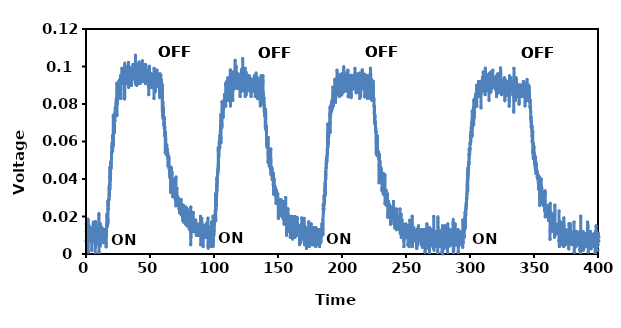
| Category | Series 0 |
|---|---|
| 0.0 | 0.007 |
| 0.1 | 0.012 |
| 0.2 | 0.016 |
| 0.3 | 0.014 |
| 0.4 | 0.009 |
| 0.5 | 0.01 |
| 0.6 | 0.007 |
| 0.7 | 0.01 |
| 0.8 | 0.015 |
| 0.9 | 0.01 |
| 1.0 | 0.009 |
| 1.1 | 0.009 |
| 1.2 | 0.012 |
| 1.3 | 0.01 |
| 1.4 | 0.007 |
| 1.5 | 0.015 |
| 1.6 | 0.015 |
| 1.7 | 0.018 |
| 1.8 | 0.001 |
| 1.9 | 0.014 |
| 2.0 | 0.015 |
| 2.1 | 0.01 |
| 2.2 | 0.007 |
| 2.3 | 0.015 |
| 2.4 | 0.012 |
| 2.5 | 0.012 |
| 2.6 | 0.013 |
| 2.7 | 0.014 |
| 2.8 | 0.009 |
| 2.9 | 0.013 |
| 3.0 | 0.011 |
| 3.1 | 0.013 |
| 3.2 | 0.012 |
| 3.3 | 0.012 |
| 3.4 | 0.009 |
| 3.5 | 0.01 |
| 3.6 | 0.01 |
| 3.7 | 0.012 |
| 3.8 | 0.009 |
| 3.9 | 0.011 |
| 4.0 | 0.01 |
| 4.1 | 0.011 |
| 4.2 | 0.013 |
| 4.3 | 0.009 |
| 4.4 | 0.008 |
| 4.5 | 0.002 |
| 4.6 | 0.006 |
| 4.7 | 0.011 |
| 4.8 | 0.007 |
| 4.9 | 0.014 |
| 5.0 | 0.007 |
| 5.1 | 0.012 |
| 5.2 | 0.013 |
| 5.3 | 0.009 |
| 5.4 | 0.01 |
| 5.5 | 0.009 |
| 5.6 | 0.016 |
| 5.7 | 0.01 |
| 5.8 | 0.017 |
| 5.9 | 0.008 |
| 6.0 | 0.012 |
| 6.1 | 0.013 |
| 6.2 | 0.009 |
| 6.3 | 0.014 |
| 6.4 | 0.011 |
| 6.5 | 0.012 |
| 6.6 | 0.009 |
| 6.7 | 0.01 |
| 6.8 | 0.012 |
| 6.9 | 0.011 |
| 7.0 | 0.01 |
| 7.1 | 0.008 |
| 7.2 | 0.005 |
| 7.3 | -0.002 |
| 7.4 | 0.016 |
| 7.5 | 0.015 |
| 7.6 | 0.006 |
| 7.7 | 0.012 |
| 7.8 | 0.009 |
| 7.9 | 0.013 |
| 8.0 | 0.014 |
| 8.1 | 0.01 |
| 8.2 | 0.012 |
| 8.3 | 0.011 |
| 8.4 | 0.013 |
| 8.5 | 0.01 |
| 8.6 | 0.009 |
| 8.7 | 0.012 |
| 8.8 | 0.012 |
| 8.9 | 0.012 |
| 9.0 | 0.01 |
| 9.1 | 0.011 |
| 9.2 | 0.01 |
| 9.3 | 0.012 |
| 9.4 | 0.008 |
| 9.5 | 0.011 |
| 9.6 | 0.011 |
| 9.7 | 0.009 |
| 9.8 | 0.011 |
| 9.9 | 0.005 |
| 10.0 | 0.016 |
| 10.1 | 0.021 |
| 10.2 | 0.001 |
| 10.3 | 0.007 |
| 10.4 | 0.007 |
| 10.5 | 0.011 |
| 10.6 | 0.005 |
| 10.7 | 0.009 |
| 10.8 | 0.01 |
| 10.9 | 0.012 |
| 11.0 | 0.01 |
| 11.1 | 0.005 |
| 11.2 | 0.005 |
| 11.3 | 0.015 |
| 11.4 | 0.015 |
| 11.5 | 0.007 |
| 11.6 | 0.009 |
| 11.7 | 0.011 |
| 11.8 | 0.011 |
| 11.9 | 0.01 |
| 12.0 | 0.01 |
| 12.1 | 0.012 |
| 12.2 | 0.01 |
| 12.3 | 0.01 |
| 12.4 | 0.014 |
| 12.5 | 0.009 |
| 12.6 | 0.013 |
| 12.7 | 0.012 |
| 12.8 | 0.012 |
| 12.9 | 0.01 |
| 13.0 | 0.008 |
| 13.1 | 0.009 |
| 13.2 | 0.012 |
| 13.3 | 0.01 |
| 13.4 | 0.01 |
| 13.5 | 0.012 |
| 13.6 | 0.01 |
| 13.7 | 0.012 |
| 13.8 | 0.006 |
| 13.9 | 0.013 |
| 14.0 | 0.011 |
| 14.1 | 0.012 |
| 14.2 | 0.01 |
| 14.3 | 0.007 |
| 14.4 | 0.01 |
| 14.5 | 0.011 |
| 14.6 | 0.009 |
| 14.7 | 0.008 |
| 14.8 | 0.009 |
| 14.9 | 0.01 |
| 15.0 | 0.009 |
| 15.1 | 0.012 |
| 15.2 | 0.013 |
| 15.3 | 0.012 |
| 15.4 | 0.013 |
| 15.5 | 0.012 |
| 15.6 | 0.013 |
| 15.7 | 0.004 |
| 15.8 | 0.006 |
| 15.9 | 0.009 |
| 16.0 | 0.013 |
| 16.1 | 0.016 |
| 16.2 | 0.016 |
| 16.3 | 0.02 |
| 16.4 | 0.021 |
| 16.5 | 0.015 |
| 16.6 | 0.015 |
| 16.7 | 0.02 |
| 16.8 | 0.021 |
| 16.9 | 0.016 |
| 17.0 | 0.028 |
| 17.1 | 0.017 |
| 17.2 | 0.018 |
| 17.3 | 0.024 |
| 17.4 | 0.024 |
| 17.5 | 0.028 |
| 17.6 | 0.026 |
| 17.7 | 0.029 |
| 17.8 | 0.029 |
| 17.9 | 0.029 |
| 18.0 | 0.032 |
| 18.1 | 0.036 |
| 18.2 | 0.035 |
| 18.3 | 0.037 |
| 18.4 | 0.031 |
| 18.5 | 0.041 |
| 18.6 | 0.046 |
| 18.7 | 0.035 |
| 18.8 | 0.037 |
| 18.9 | 0.04 |
| 19.0 | 0.039 |
| 19.1 | 0.042 |
| 19.2 | 0.043 |
| 19.3 | 0.047 |
| 19.4 | 0.049 |
| 19.5 | 0.046 |
| 19.6 | 0.046 |
| 19.7 | 0.048 |
| 19.8 | 0.05 |
| 19.9 | 0.05 |
| 20.0 | 0.054 |
| 20.1 | 0.054 |
| 20.2 | 0.057 |
| 20.3 | 0.059 |
| 20.4 | 0.057 |
| 20.5 | 0.055 |
| 20.6 | 0.059 |
| 20.7 | 0.062 |
| 20.8 | 0.055 |
| 20.9 | 0.063 |
| 21.0 | 0.063 |
| 21.1 | 0.061 |
| 21.2 | 0.059 |
| 21.3 | 0.074 |
| 21.4 | 0.058 |
| 21.5 | 0.071 |
| 21.6 | 0.064 |
| 21.7 | 0.068 |
| 21.8 | 0.066 |
| 21.9 | 0.065 |
| 22.0 | 0.067 |
| 22.1 | 0.071 |
| 22.2 | 0.071 |
| 22.3 | 0.065 |
| 22.4 | 0.074 |
| 22.5 | 0.073 |
| 22.6 | 0.071 |
| 22.7 | 0.075 |
| 22.8 | 0.076 |
| 22.9 | 0.078 |
| 23.0 | 0.077 |
| 23.1 | 0.075 |
| 23.2 | 0.076 |
| 23.3 | 0.078 |
| 23.4 | 0.08 |
| 23.5 | 0.078 |
| 23.6 | 0.081 |
| 23.7 | 0.083 |
| 23.8 | 0.081 |
| 23.9 | 0.083 |
| 24.0 | 0.081 |
| 24.1 | 0.091 |
| 24.2 | 0.074 |
| 24.3 | 0.081 |
| 24.4 | 0.084 |
| 24.5 | 0.08 |
| 24.6 | 0.087 |
| 24.7 | 0.085 |
| 24.8 | 0.085 |
| 24.9 | 0.086 |
| 25.0 | 0.084 |
| 25.1 | 0.086 |
| 25.2 | 0.083 |
| 25.3 | 0.087 |
| 25.4 | 0.085 |
| 25.5 | 0.088 |
| 25.6 | 0.092 |
| 25.7 | 0.09 |
| 25.8 | 0.09 |
| 25.9 | 0.089 |
| 26.0 | 0.089 |
| 26.1 | 0.09 |
| 26.2 | 0.092 |
| 26.3 | 0.089 |
| 26.4 | 0.092 |
| 26.5 | 0.093 |
| 26.6 | 0.088 |
| 26.7 | 0.09 |
| 26.8 | 0.09 |
| 26.9 | 0.095 |
| 27.0 | 0.085 |
| 27.1 | 0.085 |
| 27.2 | 0.088 |
| 27.3 | 0.083 |
| 27.4 | 0.093 |
| 27.5 | 0.093 |
| 27.6 | 0.094 |
| 27.7 | 0.093 |
| 27.8 | 0.094 |
| 27.9 | 0.093 |
| 28.0 | 0.099 |
| 28.1 | 0.093 |
| 28.2 | 0.091 |
| 28.3 | 0.095 |
| 28.4 | 0.099 |
| 28.5 | 0.097 |
| 28.6 | 0.095 |
| 28.7 | 0.093 |
| 28.8 | 0.095 |
| 28.9 | 0.097 |
| 29.0 | 0.094 |
| 29.1 | 0.095 |
| 29.2 | 0.092 |
| 29.3 | 0.094 |
| 29.4 | 0.098 |
| 29.5 | 0.094 |
| 29.6 | 0.095 |
| 29.7 | 0.095 |
| 29.8 | 0.093 |
| 29.9 | 0.097 |
| 30.0 | 0.097 |
| 30.1 | 0.085 |
| 30.2 | 0.084 |
| 30.3 | 0.101 |
| 30.4 | 0.099 |
| 30.5 | 0.097 |
| 30.6 | 0.097 |
| 30.7 | 0.095 |
| 30.8 | 0.097 |
| 30.9 | 0.1 |
| 31.0 | 0.098 |
| 31.1 | 0.091 |
| 31.2 | 0.099 |
| 31.3 | 0.096 |
| 31.4 | 0.095 |
| 31.5 | 0.099 |
| 31.6 | 0.098 |
| 31.7 | 0.095 |
| 31.8 | 0.095 |
| 31.9 | 0.098 |
| 32.0 | 0.096 |
| 32.1 | 0.095 |
| 32.2 | 0.095 |
| 32.3 | 0.098 |
| 32.4 | 0.096 |
| 32.5 | 0.098 |
| 32.6 | 0.096 |
| 32.7 | 0.098 |
| 32.8 | 0.094 |
| 32.9 | 0.092 |
| 33.0 | 0.093 |
| 33.1 | 0.097 |
| 33.2 | 0.102 |
| 33.3 | 0.089 |
| 33.4 | 0.095 |
| 33.5 | 0.096 |
| 33.6 | 0.097 |
| 33.7 | 0.096 |
| 33.8 | 0.094 |
| 33.9 | 0.094 |
| 34.0 | 0.098 |
| 34.1 | 0.09 |
| 34.2 | 0.093 |
| 34.3 | 0.095 |
| 34.4 | 0.099 |
| 34.5 | 0.099 |
| 34.6 | 0.094 |
| 34.7 | 0.096 |
| 34.8 | 0.097 |
| 34.9 | 0.096 |
| 35.0 | 0.095 |
| 35.1 | 0.095 |
| 35.2 | 0.099 |
| 35.3 | 0.096 |
| 35.4 | 0.097 |
| 35.5 | 0.096 |
| 35.6 | 0.09 |
| 35.7 | 0.093 |
| 35.8 | 0.093 |
| 35.9 | 0.093 |
| 36.0 | 0.098 |
| 36.1 | 0.095 |
| 36.2 | 0.095 |
| 36.3 | 0.096 |
| 36.4 | 0.098 |
| 36.5 | 0.098 |
| 36.6 | 0.094 |
| 36.7 | 0.101 |
| 36.8 | 0.099 |
| 36.9 | 0.098 |
| 37.0 | 0.095 |
| 37.1 | 0.096 |
| 37.2 | 0.097 |
| 37.3 | 0.096 |
| 37.4 | 0.096 |
| 37.5 | 0.096 |
| 37.6 | 0.098 |
| 37.7 | 0.097 |
| 37.8 | 0.099 |
| 37.9 | 0.098 |
| 38.0 | 0.096 |
| 38.1 | 0.1 |
| 38.2 | 0.094 |
| 38.3 | 0.095 |
| 38.4 | 0.094 |
| 38.5 | 0.093 |
| 38.6 | 0.095 |
| 38.7 | 0.106 |
| 38.8 | 0.092 |
| 38.9 | 0.091 |
| 39.0 | 0.096 |
| 39.1 | 0.099 |
| 39.2 | 0.097 |
| 39.3 | 0.096 |
| 39.4 | 0.096 |
| 39.5 | 0.101 |
| 39.6 | 0.098 |
| 39.7 | 0.09 |
| 39.8 | 0.096 |
| 39.9 | 0.092 |
| 40.0 | 0.095 |
| 40.1 | 0.096 |
| 40.2 | 0.098 |
| 40.3 | 0.098 |
| 40.4 | 0.093 |
| 40.5 | 0.098 |
| 40.6 | 0.097 |
| 40.7 | 0.094 |
| 40.8 | 0.094 |
| 40.9 | 0.098 |
| 41.0 | 0.096 |
| 41.1 | 0.096 |
| 41.2 | 0.099 |
| 41.3 | 0.094 |
| 41.4 | 0.1 |
| 41.5 | 0.102 |
| 41.6 | 0.091 |
| 41.7 | 0.097 |
| 41.8 | 0.093 |
| 41.9 | 0.093 |
| 42.0 | 0.097 |
| 42.1 | 0.096 |
| 42.2 | 0.094 |
| 42.3 | 0.095 |
| 42.4 | 0.091 |
| 42.5 | 0.095 |
| 42.6 | 0.094 |
| 42.7 | 0.096 |
| 42.8 | 0.098 |
| 42.9 | 0.096 |
| 43.0 | 0.093 |
| 43.1 | 0.093 |
| 43.2 | 0.095 |
| 43.3 | 0.096 |
| 43.4 | 0.093 |
| 43.5 | 0.095 |
| 43.6 | 0.098 |
| 43.7 | 0.099 |
| 43.8 | 0.095 |
| 43.9 | 0.096 |
| 44.0 | 0.103 |
| 44.1 | 0.093 |
| 44.2 | 0.099 |
| 44.3 | 0.093 |
| 44.4 | 0.099 |
| 44.5 | 0.095 |
| 44.6 | 0.093 |
| 44.7 | 0.092 |
| 44.8 | 0.095 |
| 44.9 | 0.101 |
| 45.0 | 0.096 |
| 45.1 | 0.092 |
| 45.2 | 0.097 |
| 45.3 | 0.093 |
| 45.4 | 0.096 |
| 45.5 | 0.097 |
| 45.6 | 0.098 |
| 45.7 | 0.093 |
| 45.8 | 0.092 |
| 45.9 | 0.096 |
| 46.0 | 0.093 |
| 46.1 | 0.095 |
| 46.2 | 0.092 |
| 46.3 | 0.098 |
| 46.4 | 0.091 |
| 46.5 | 0.094 |
| 46.6 | 0.101 |
| 46.7 | 0.096 |
| 46.8 | 0.095 |
| 46.9 | 0.093 |
| 47.0 | 0.093 |
| 47.1 | 0.097 |
| 47.2 | 0.098 |
| 47.3 | 0.094 |
| 47.4 | 0.096 |
| 47.5 | 0.092 |
| 47.6 | 0.094 |
| 47.7 | 0.093 |
| 47.8 | 0.094 |
| 47.9 | 0.096 |
| 48.0 | 0.093 |
| 48.1 | 0.095 |
| 48.2 | 0.098 |
| 48.3 | 0.093 |
| 48.4 | 0.093 |
| 48.5 | 0.093 |
| 48.6 | 0.098 |
| 48.7 | 0.091 |
| 48.8 | 0.089 |
| 48.9 | 0.092 |
| 49.0 | 0.085 |
| 49.1 | 0.094 |
| 49.2 | 0.098 |
| 49.3 | 0.097 |
| 49.4 | 0.093 |
| 49.5 | 0.1 |
| 49.6 | 0.098 |
| 49.7 | 0.095 |
| 49.8 | 0.093 |
| 49.9 | 0.09 |
| 50.0 | 0.093 |
| 50.1 | 0.092 |
| 50.2 | 0.095 |
| 50.3 | 0.093 |
| 50.4 | 0.093 |
| 50.5 | 0.092 |
| 50.6 | 0.096 |
| 50.7 | 0.096 |
| 50.8 | 0.094 |
| 50.9 | 0.09 |
| 51.0 | 0.089 |
| 51.1 | 0.089 |
| 51.2 | 0.089 |
| 51.3 | 0.093 |
| 51.4 | 0.095 |
| 51.5 | 0.095 |
| 51.6 | 0.095 |
| 51.7 | 0.092 |
| 51.8 | 0.09 |
| 51.9 | 0.092 |
| 52.0 | 0.092 |
| 52.1 | 0.091 |
| 52.2 | 0.093 |
| 52.3 | 0.095 |
| 52.4 | 0.095 |
| 52.5 | 0.094 |
| 52.6 | 0.093 |
| 52.7 | 0.092 |
| 52.8 | 0.095 |
| 52.9 | 0.096 |
| 53.0 | 0.094 |
| 53.1 | 0.083 |
| 53.2 | 0.099 |
| 53.3 | 0.089 |
| 53.4 | 0.095 |
| 53.5 | 0.095 |
| 53.6 | 0.096 |
| 53.7 | 0.093 |
| 53.8 | 0.092 |
| 53.9 | 0.09 |
| 54.0 | 0.095 |
| 54.1 | 0.087 |
| 54.2 | 0.088 |
| 54.3 | 0.096 |
| 54.4 | 0.093 |
| 54.5 | 0.092 |
| 54.6 | 0.093 |
| 54.7 | 0.092 |
| 54.8 | 0.089 |
| 54.9 | 0.094 |
| 55.0 | 0.093 |
| 55.1 | 0.095 |
| 55.2 | 0.095 |
| 55.3 | 0.095 |
| 55.4 | 0.098 |
| 55.5 | 0.09 |
| 55.6 | 0.092 |
| 55.7 | 0.094 |
| 55.8 | 0.094 |
| 55.9 | 0.095 |
| 56.0 | 0.096 |
| 56.1 | 0.09 |
| 56.2 | 0.092 |
| 56.3 | 0.093 |
| 56.4 | 0.091 |
| 56.5 | 0.093 |
| 56.6 | 0.093 |
| 56.7 | 0.095 |
| 56.8 | 0.093 |
| 56.9 | 0.093 |
| 57.0 | 0.092 |
| 57.1 | 0.092 |
| 57.2 | 0.09 |
| 57.3 | 0.089 |
| 57.4 | 0.095 |
| 57.5 | 0.084 |
| 57.6 | 0.085 |
| 57.7 | 0.089 |
| 57.8 | 0.096 |
| 57.9 | 0.093 |
| 58.0 | 0.092 |
| 58.1 | 0.092 |
| 58.2 | 0.087 |
| 58.3 | 0.095 |
| 58.4 | 0.095 |
| 58.5 | 0.091 |
| 58.6 | 0.091 |
| 58.7 | 0.093 |
| 58.8 | 0.092 |
| 58.9 | 0.09 |
| 59.0 | 0.092 |
| 59.1 | 0.091 |
| 59.2 | 0.089 |
| 59.3 | 0.087 |
| 59.4 | 0.088 |
| 59.5 | 0.086 |
| 59.6 | 0.082 |
| 59.7 | 0.076 |
| 59.8 | 0.09 |
| 59.9 | 0.074 |
| 60.0 | 0.074 |
| 60.1 | 0.081 |
| 60.2 | 0.077 |
| 60.3 | 0.077 |
| 60.4 | 0.078 |
| 60.5 | 0.078 |
| 60.6 | 0.076 |
| 60.7 | 0.069 |
| 60.8 | 0.073 |
| 60.9 | 0.073 |
| 61.0 | 0.072 |
| 61.1 | 0.072 |
| 61.2 | 0.067 |
| 61.3 | 0.07 |
| 61.4 | 0.067 |
| 61.5 | 0.068 |
| 61.6 | 0.063 |
| 61.7 | 0.064 |
| 61.8 | 0.065 |
| 61.9 | 0.054 |
| 62.0 | 0.065 |
| 62.1 | 0.059 |
| 62.2 | 0.063 |
| 62.3 | 0.057 |
| 62.4 | 0.059 |
| 62.5 | 0.056 |
| 62.6 | 0.058 |
| 62.7 | 0.054 |
| 62.8 | 0.053 |
| 62.9 | 0.054 |
| 63.0 | 0.055 |
| 63.1 | 0.058 |
| 63.2 | 0.056 |
| 63.3 | 0.054 |
| 63.4 | 0.055 |
| 63.5 | 0.056 |
| 63.6 | 0.053 |
| 63.7 | 0.052 |
| 63.8 | 0.054 |
| 63.9 | 0.053 |
| 64.0 | 0.051 |
| 64.1 | 0.047 |
| 64.2 | 0.049 |
| 64.3 | 0.048 |
| 64.4 | 0.048 |
| 64.5 | 0.051 |
| 64.6 | 0.052 |
| 64.7 | 0.049 |
| 64.8 | 0.051 |
| 64.9 | 0.046 |
| 65.0 | 0.047 |
| 65.1 | 0.046 |
| 65.2 | 0.043 |
| 65.3 | 0.046 |
| 65.4 | 0.041 |
| 65.5 | 0.046 |
| 65.6 | 0.043 |
| 65.7 | 0.043 |
| 65.8 | 0.042 |
| 65.9 | 0.042 |
| 66.0 | 0.04 |
| 66.1 | 0.033 |
| 66.2 | 0.046 |
| 66.3 | 0.043 |
| 66.4 | 0.039 |
| 66.5 | 0.043 |
| 66.6 | 0.046 |
| 66.7 | 0.045 |
| 66.8 | 0.045 |
| 66.9 | 0.037 |
| 67.0 | 0.038 |
| 67.1 | 0.043 |
| 67.2 | 0.043 |
| 67.3 | 0.035 |
| 67.4 | 0.038 |
| 67.5 | 0.039 |
| 67.6 | 0.038 |
| 67.7 | 0.037 |
| 67.8 | 0.031 |
| 67.9 | 0.031 |
| 68.0 | 0.033 |
| 68.1 | 0.034 |
| 68.2 | 0.04 |
| 68.3 | 0.036 |
| 68.4 | 0.034 |
| 68.5 | 0.034 |
| 68.6 | 0.035 |
| 68.7 | 0.032 |
| 68.8 | 0.031 |
| 68.9 | 0.031 |
| 69.0 | 0.031 |
| 69.1 | 0.032 |
| 69.2 | 0.034 |
| 69.3 | 0.032 |
| 69.4 | 0.032 |
| 69.5 | 0.032 |
| 69.6 | 0.03 |
| 69.7 | 0.034 |
| 69.8 | 0.029 |
| 69.9 | 0.035 |
| 70.0 | 0.034 |
| 70.1 | 0.03 |
| 70.2 | 0.026 |
| 70.3 | 0.041 |
| 70.4 | 0.032 |
| 70.5 | 0.029 |
| 70.6 | 0.032 |
| 70.7 | 0.03 |
| 70.8 | 0.03 |
| 70.9 | 0.031 |
| 71.0 | 0.031 |
| 71.1 | 0.035 |
| 71.2 | 0.029 |
| 71.3 | 0.029 |
| 71.4 | 0.027 |
| 71.5 | 0.029 |
| 71.6 | 0.028 |
| 71.7 | 0.027 |
| 71.8 | 0.029 |
| 71.9 | 0.027 |
| 72.0 | 0.03 |
| 72.1 | 0.026 |
| 72.2 | 0.026 |
| 72.3 | 0.027 |
| 72.4 | 0.027 |
| 72.5 | 0.029 |
| 72.6 | 0.026 |
| 72.7 | 0.024 |
| 72.8 | 0.025 |
| 72.9 | 0.027 |
| 73.0 | 0.026 |
| 73.1 | 0.022 |
| 73.2 | 0.024 |
| 73.3 | 0.023 |
| 73.4 | 0.022 |
| 73.5 | 0.023 |
| 73.6 | 0.024 |
| 73.7 | 0.022 |
| 73.8 | 0.025 |
| 73.9 | 0.027 |
| 74.0 | 0.027 |
| 74.1 | 0.024 |
| 74.2 | 0.025 |
| 74.3 | 0.029 |
| 74.4 | 0.023 |
| 74.5 | 0.021 |
| 74.6 | 0.025 |
| 74.7 | 0.021 |
| 74.8 | 0.024 |
| 74.9 | 0.024 |
| 75.0 | 0.025 |
| 75.1 | 0.025 |
| 75.2 | 0.023 |
| 75.3 | 0.02 |
| 75.4 | 0.023 |
| 75.5 | 0.02 |
| 75.6 | 0.018 |
| 75.7 | 0.022 |
| 75.8 | 0.022 |
| 75.9 | 0.021 |
| 76.0 | 0.018 |
| 76.1 | 0.026 |
| 76.2 | 0.021 |
| 76.3 | 0.017 |
| 76.4 | 0.021 |
| 76.5 | 0.021 |
| 76.6 | 0.02 |
| 76.7 | 0.022 |
| 76.8 | 0.023 |
| 76.9 | 0.019 |
| 77.0 | 0.018 |
| 77.1 | 0.023 |
| 77.2 | 0.02 |
| 77.3 | 0.019 |
| 77.4 | 0.021 |
| 77.5 | 0.017 |
| 77.6 | 0.02 |
| 77.7 | 0.016 |
| 77.8 | 0.018 |
| 77.9 | 0.016 |
| 78.0 | 0.021 |
| 78.1 | 0.025 |
| 78.2 | 0.02 |
| 78.3 | 0.017 |
| 78.4 | 0.016 |
| 78.5 | 0.017 |
| 78.6 | 0.02 |
| 78.7 | 0.02 |
| 78.8 | 0.022 |
| 78.9 | 0.02 |
| 79.0 | 0.024 |
| 79.1 | 0.015 |
| 79.2 | 0.02 |
| 79.3 | 0.018 |
| 79.4 | 0.019 |
| 79.5 | 0.019 |
| 79.6 | 0.017 |
| 79.7 | 0.018 |
| 79.8 | 0.018 |
| 79.9 | 0.019 |
| 80.0 | 0.017 |
| 80.1 | 0.023 |
| 80.2 | 0.018 |
| 80.3 | 0.016 |
| 80.4 | 0.018 |
| 80.5 | 0.015 |
| 80.6 | 0.014 |
| 80.7 | 0.02 |
| 80.8 | 0.02 |
| 80.9 | 0.018 |
| 81.0 | 0.016 |
| 81.1 | 0.013 |
| 81.2 | 0.014 |
| 81.3 | 0.018 |
| 81.4 | 0.016 |
| 81.5 | 0.015 |
| 81.6 | 0.015 |
| 81.7 | 0.016 |
| 81.8 | 0.005 |
| 81.9 | 0.025 |
| 82.0 | 0.009 |
| 82.1 | 0.015 |
| 82.2 | 0.016 |
| 82.3 | 0.019 |
| 82.4 | 0.012 |
| 82.5 | 0.015 |
| 82.6 | 0.012 |
| 82.7 | 0.018 |
| 82.8 | 0.019 |
| 82.9 | 0.015 |
| 83.0 | 0.015 |
| 83.1 | 0.013 |
| 83.2 | 0.016 |
| 83.3 | 0.014 |
| 83.4 | 0.017 |
| 83.5 | 0.013 |
| 83.6 | 0.014 |
| 83.7 | 0.019 |
| 83.8 | 0.022 |
| 83.9 | 0.012 |
| 84.0 | 0.015 |
| 84.1 | 0.015 |
| 84.2 | 0.014 |
| 84.3 | 0.015 |
| 84.4 | 0.015 |
| 84.5 | 0.018 |
| 84.6 | 0.017 |
| 84.7 | 0.015 |
| 84.8 | 0.015 |
| 84.9 | 0.013 |
| 85.0 | 0.013 |
| 85.1 | 0.013 |
| 85.2 | 0.016 |
| 85.3 | 0.015 |
| 85.4 | 0.012 |
| 85.5 | 0.016 |
| 85.6 | 0.016 |
| 85.7 | 0.018 |
| 85.8 | 0.012 |
| 85.9 | 0.013 |
| 86.0 | 0.016 |
| 86.1 | 0.013 |
| 86.2 | 0.01 |
| 86.3 | 0.013 |
| 86.4 | 0.011 |
| 86.5 | 0.013 |
| 86.6 | 0.013 |
| 86.7 | 0.011 |
| 86.8 | 0.015 |
| 86.9 | 0.015 |
| 87.0 | 0.01 |
| 87.1 | 0.014 |
| 87.2 | 0.016 |
| 87.3 | 0.015 |
| 87.4 | 0.012 |
| 87.5 | 0.013 |
| 87.6 | 0.013 |
| 87.7 | 0.014 |
| 87.8 | 0.014 |
| 87.9 | 0.01 |
| 88.0 | 0.014 |
| 88.1 | 0.011 |
| 88.2 | 0.011 |
| 88.3 | 0.013 |
| 88.4 | 0.014 |
| 88.5 | 0.012 |
| 88.6 | 0.013 |
| 88.7 | 0.01 |
| 88.8 | 0.012 |
| 88.9 | 0.013 |
| 89.0 | 0.013 |
| 89.1 | 0.013 |
| 89.2 | 0.013 |
| 89.3 | 0.01 |
| 89.4 | 0.013 |
| 89.5 | 0.02 |
| 89.6 | 0.005 |
| 89.7 | 0.015 |
| 89.8 | 0.011 |
| 89.9 | 0.01 |
| 90.0 | 0.018 |
| 90.1 | 0.013 |
| 90.2 | 0.01 |
| 90.3 | 0.007 |
| 90.4 | 0.012 |
| 90.5 | 0.019 |
| 90.6 | 0.012 |
| 90.7 | 0.014 |
| 90.8 | 0.012 |
| 90.9 | 0.013 |
| 91.0 | 0.015 |
| 91.1 | 0.013 |
| 91.2 | 0.01 |
| 91.3 | 0.01 |
| 91.4 | 0.015 |
| 91.5 | 0.004 |
| 91.6 | 0.013 |
| 91.7 | 0.012 |
| 91.8 | 0.013 |
| 91.9 | 0.013 |
| 92.0 | 0.015 |
| 92.1 | 0.011 |
| 92.2 | 0.015 |
| 92.3 | 0.015 |
| 92.4 | 0.011 |
| 92.5 | 0.012 |
| 92.6 | 0.013 |
| 92.7 | 0.015 |
| 92.8 | 0.009 |
| 92.9 | 0.012 |
| 93.0 | 0.015 |
| 93.1 | 0.014 |
| 93.2 | 0.013 |
| 93.3 | 0.012 |
| 93.4 | 0.009 |
| 93.5 | 0.013 |
| 93.6 | 0.01 |
| 93.7 | 0.01 |
| 93.8 | 0.011 |
| 93.9 | 0.01 |
| 94.0 | 0.012 |
| 94.1 | 0.009 |
| 94.2 | 0.012 |
| 94.3 | 0.016 |
| 94.4 | 0.016 |
| 94.5 | 0.01 |
| 94.6 | 0.012 |
| 94.7 | 0.012 |
| 94.8 | 0.009 |
| 94.9 | 0.013 |
| 95.0 | 0.013 |
| 95.1 | 0.01 |
| 95.2 | 0.012 |
| 95.3 | 0.019 |
| 95.4 | 0.004 |
| 95.5 | 0.005 |
| 95.6 | 0.01 |
| 95.7 | 0.011 |
| 95.8 | 0.012 |
| 95.9 | 0.012 |
| 96.0 | 0.012 |
| 96.1 | 0.009 |
| 96.2 | 0.014 |
| 96.3 | 0.014 |
| 96.4 | 0.012 |
| 96.5 | 0.013 |
| 96.6 | 0.013 |
| 96.7 | 0.009 |
| 96.8 | 0.01 |
| 96.9 | 0.012 |
| 97.0 | 0.007 |
| 97.1 | 0.009 |
| 97.2 | 0.009 |
| 97.3 | 0.007 |
| 97.4 | 0.008 |
| 97.5 | 0.006 |
| 97.6 | 0.01 |
| 97.7 | 0.011 |
| 97.8 | 0.013 |
| 97.9 | 0.004 |
| 98.0 | 0.011 |
| 98.1 | 0.017 |
| 98.2 | 0.007 |
| 98.3 | 0.015 |
| 98.4 | 0.015 |
| 98.5 | 0.007 |
| 98.6 | 0.01 |
| 98.7 | 0.012 |
| 98.8 | 0.011 |
| 98.9 | 0.01 |
| 99.0 | 0.012 |
| 99.1 | 0.009 |
| 99.2 | 0.013 |
| 99.3 | 0.02 |
| 99.4 | 0.005 |
| 99.5 | 0.006 |
| 99.6 | 0.011 |
| 99.7 | 0.013 |
| 99.8 | 0.014 |
| 99.9 | 0.01 |
| 100.0 | 0.015 |
| 100.1 | 0.012 |
| 100.2 | 0.018 |
| 100.3 | 0.016 |
| 100.4 | 0.018 |
| 100.5 | 0.017 |
| 100.6 | 0.019 |
| 100.7 | 0.02 |
| 100.8 | 0.021 |
| 100.9 | 0.019 |
| 101.0 | 0.023 |
| 101.1 | 0.021 |
| 101.2 | 0.026 |
| 101.3 | 0.032 |
| 101.4 | 0.018 |
| 101.5 | 0.026 |
| 101.6 | 0.024 |
| 101.7 | 0.026 |
| 101.8 | 0.031 |
| 101.9 | 0.026 |
| 102.0 | 0.037 |
| 102.1 | 0.032 |
| 102.2 | 0.04 |
| 102.3 | 0.04 |
| 102.4 | 0.034 |
| 102.5 | 0.038 |
| 102.6 | 0.04 |
| 102.7 | 0.042 |
| 102.8 | 0.042 |
| 102.9 | 0.043 |
| 103.0 | 0.045 |
| 103.1 | 0.044 |
| 103.2 | 0.045 |
| 103.3 | 0.056 |
| 103.4 | 0.055 |
| 103.5 | 0.046 |
| 103.6 | 0.051 |
| 103.7 | 0.052 |
| 103.8 | 0.056 |
| 103.9 | 0.053 |
| 104.0 | 0.056 |
| 104.1 | 0.059 |
| 104.2 | 0.06 |
| 104.3 | 0.061 |
| 104.4 | 0.059 |
| 104.5 | 0.057 |
| 104.6 | 0.063 |
| 104.7 | 0.061 |
| 104.8 | 0.063 |
| 104.9 | 0.063 |
| 105.0 | 0.066 |
| 105.1 | 0.067 |
| 105.2 | 0.069 |
| 105.3 | 0.074 |
| 105.4 | 0.06 |
| 105.5 | 0.062 |
| 105.6 | 0.071 |
| 105.7 | 0.071 |
| 105.8 | 0.067 |
| 105.9 | 0.073 |
| 106.0 | 0.074 |
| 106.1 | 0.068 |
| 106.2 | 0.069 |
| 106.3 | 0.081 |
| 106.4 | 0.077 |
| 106.5 | 0.076 |
| 106.6 | 0.074 |
| 106.7 | 0.078 |
| 106.8 | 0.079 |
| 106.9 | 0.079 |
| 107.0 | 0.078 |
| 107.1 | 0.075 |
| 107.2 | 0.073 |
| 107.3 | 0.078 |
| 107.4 | 0.077 |
| 107.5 | 0.078 |
| 107.6 | 0.079 |
| 107.7 | 0.081 |
| 107.8 | 0.081 |
| 107.9 | 0.082 |
| 108.0 | 0.081 |
| 108.1 | 0.082 |
| 108.2 | 0.085 |
| 108.3 | 0.082 |
| 108.4 | 0.084 |
| 108.5 | 0.085 |
| 108.6 | 0.085 |
| 108.7 | 0.085 |
| 108.8 | 0.085 |
| 108.9 | 0.085 |
| 109.0 | 0.082 |
| 109.1 | 0.079 |
| 109.2 | 0.09 |
| 109.3 | 0.091 |
| 109.4 | 0.09 |
| 109.5 | 0.09 |
| 109.6 | 0.083 |
| 109.7 | 0.086 |
| 109.8 | 0.084 |
| 109.9 | 0.082 |
| 110.0 | 0.092 |
| 110.1 | 0.085 |
| 110.2 | 0.087 |
| 110.3 | 0.09 |
| 110.4 | 0.089 |
| 110.5 | 0.09 |
| 110.6 | 0.087 |
| 110.7 | 0.091 |
| 110.8 | 0.094 |
| 110.9 | 0.091 |
| 111.0 | 0.086 |
| 111.1 | 0.082 |
| 111.2 | 0.092 |
| 111.3 | 0.09 |
| 111.4 | 0.09 |
| 111.5 | 0.09 |
| 111.6 | 0.089 |
| 111.7 | 0.092 |
| 111.8 | 0.093 |
| 111.9 | 0.089 |
| 112.0 | 0.092 |
| 112.1 | 0.09 |
| 112.2 | 0.091 |
| 112.3 | 0.088 |
| 112.4 | 0.092 |
| 112.5 | 0.092 |
| 112.6 | 0.091 |
| 112.7 | 0.09 |
| 112.8 | 0.098 |
| 112.9 | 0.079 |
| 113.0 | 0.092 |
| 113.1 | 0.095 |
| 113.2 | 0.093 |
| 113.3 | 0.089 |
| 113.4 | 0.096 |
| 113.5 | 0.093 |
| 113.6 | 0.088 |
| 113.7 | 0.092 |
| 113.8 | 0.087 |
| 113.9 | 0.092 |
| 114.0 | 0.091 |
| 114.1 | 0.095 |
| 114.2 | 0.093 |
| 114.3 | 0.095 |
| 114.4 | 0.09 |
| 114.5 | 0.091 |
| 114.6 | 0.088 |
| 114.7 | 0.082 |
| 114.8 | 0.092 |
| 114.9 | 0.097 |
| 115.0 | 0.095 |
| 115.1 | 0.093 |
| 115.2 | 0.088 |
| 115.3 | 0.096 |
| 115.4 | 0.09 |
| 115.5 | 0.09 |
| 115.6 | 0.09 |
| 115.7 | 0.095 |
| 115.8 | 0.093 |
| 115.9 | 0.09 |
| 116.0 | 0.092 |
| 116.1 | 0.091 |
| 116.2 | 0.09 |
| 116.3 | 0.095 |
| 116.4 | 0.089 |
| 116.5 | 0.103 |
| 116.6 | 0.099 |
| 116.7 | 0.094 |
| 116.8 | 0.093 |
| 116.9 | 0.093 |
| 117.0 | 0.095 |
| 117.1 | 0.09 |
| 117.2 | 0.089 |
| 117.3 | 0.1 |
| 117.4 | 0.094 |
| 117.5 | 0.094 |
| 117.6 | 0.092 |
| 117.7 | 0.093 |
| 117.8 | 0.091 |
| 117.9 | 0.092 |
| 118.0 | 0.09 |
| 118.1 | 0.093 |
| 118.2 | 0.092 |
| 118.3 | 0.093 |
| 118.4 | 0.095 |
| 118.5 | 0.089 |
| 118.6 | 0.089 |
| 118.7 | 0.096 |
| 118.8 | 0.093 |
| 118.9 | 0.096 |
| 119.0 | 0.093 |
| 119.1 | 0.094 |
| 119.2 | 0.095 |
| 119.3 | 0.093 |
| 119.4 | 0.093 |
| 119.5 | 0.092 |
| 119.6 | 0.09 |
| 119.7 | 0.095 |
| 119.8 | 0.09 |
| 119.9 | 0.093 |
| 120.0 | 0.093 |
| 120.1 | 0.092 |
| 120.2 | 0.093 |
| 120.3 | 0.093 |
| 120.4 | 0.084 |
| 120.5 | 0.095 |
| 120.6 | 0.089 |
| 120.7 | 0.092 |
| 120.8 | 0.088 |
| 120.9 | 0.09 |
| 121.0 | 0.095 |
| 121.1 | 0.092 |
| 121.2 | 0.096 |
| 121.3 | 0.089 |
| 121.4 | 0.098 |
| 121.5 | 0.097 |
| 121.6 | 0.094 |
| 121.7 | 0.093 |
| 121.8 | 0.091 |
| 121.9 | 0.088 |
| 122.0 | 0.092 |
| 122.1 | 0.093 |
| 122.2 | 0.096 |
| 122.3 | 0.087 |
| 122.4 | 0.104 |
| 122.5 | 0.098 |
| 122.6 | 0.096 |
| 122.7 | 0.09 |
| 122.8 | 0.095 |
| 122.9 | 0.094 |
| 123.0 | 0.098 |
| 123.1 | 0.089 |
| 123.2 | 0.09 |
| 123.3 | 0.092 |
| 123.4 | 0.09 |
| 123.5 | 0.093 |
| 123.6 | 0.093 |
| 123.7 | 0.093 |
| 123.8 | 0.092 |
| 123.9 | 0.093 |
| 124.0 | 0.093 |
| 124.1 | 0.094 |
| 124.2 | 0.09 |
| 124.3 | 0.099 |
| 124.4 | 0.084 |
| 124.5 | 0.093 |
| 124.6 | 0.093 |
| 124.7 | 0.089 |
| 124.8 | 0.091 |
| 124.9 | 0.097 |
| 125.0 | 0.093 |
| 125.1 | 0.085 |
| 125.2 | 0.096 |
| 125.3 | 0.093 |
| 125.4 | 0.095 |
| 125.5 | 0.092 |
| 125.6 | 0.09 |
| 125.7 | 0.094 |
| 125.8 | 0.093 |
| 125.9 | 0.09 |
| 126.0 | 0.094 |
| 126.1 | 0.092 |
| 126.2 | 0.093 |
| 126.3 | 0.087 |
| 126.4 | 0.093 |
| 126.5 | 0.094 |
| 126.6 | 0.092 |
| 126.7 | 0.088 |
| 126.8 | 0.089 |
| 126.9 | 0.093 |
| 127.0 | 0.095 |
| 127.1 | 0.09 |
| 127.2 | 0.09 |
| 127.3 | 0.092 |
| 127.4 | 0.09 |
| 127.5 | 0.093 |
| 127.6 | 0.095 |
| 127.7 | 0.093 |
| 127.8 | 0.089 |
| 127.9 | 0.092 |
| 128.0 | 0.092 |
| 128.1 | 0.094 |
| 128.2 | 0.093 |
| 128.3 | 0.088 |
| 128.4 | 0.09 |
| 128.5 | 0.092 |
| 128.6 | 0.089 |
| 128.7 | 0.089 |
| 128.8 | 0.086 |
| 128.9 | 0.092 |
| 129.0 | 0.084 |
| 129.1 | 0.093 |
| 129.2 | 0.089 |
| 129.3 | 0.09 |
| 129.4 | 0.093 |
| 129.5 | 0.09 |
| 129.6 | 0.092 |
| 129.7 | 0.09 |
| 129.8 | 0.09 |
| 129.9 | 0.093 |
| 130.0 | 0.091 |
| 130.1 | 0.087 |
| 130.2 | 0.088 |
| 130.3 | 0.088 |
| 130.4 | 0.089 |
| 130.5 | 0.09 |
| 130.6 | 0.092 |
| 130.7 | 0.088 |
| 130.8 | 0.089 |
| 130.9 | 0.093 |
| 131.0 | 0.089 |
| 131.1 | 0.09 |
| 131.2 | 0.087 |
| 131.3 | 0.093 |
| 131.4 | 0.09 |
| 131.5 | 0.095 |
| 131.6 | 0.093 |
| 131.7 | 0.09 |
| 131.8 | 0.091 |
| 131.9 | 0.093 |
| 132.0 | 0.092 |
| 132.1 | 0.091 |
| 132.2 | 0.089 |
| 132.3 | 0.084 |
| 132.4 | 0.086 |
| 132.5 | 0.092 |
| 132.6 | 0.086 |
| 132.7 | 0.088 |
| 132.8 | 0.095 |
| 132.9 | 0.096 |
| 133.0 | 0.087 |
| 133.1 | 0.087 |
| 133.2 | 0.093 |
| 133.3 | 0.09 |
| 133.4 | 0.09 |
| 133.5 | 0.091 |
| 133.6 | 0.092 |
| 133.7 | 0.094 |
| 133.8 | 0.089 |
| 133.9 | 0.093 |
| 134.0 | 0.092 |
| 134.1 | 0.093 |
| 134.2 | 0.086 |
| 134.3 | 0.083 |
| 134.4 | 0.093 |
| 134.5 | 0.09 |
| 134.6 | 0.092 |
| 134.7 | 0.087 |
| 134.8 | 0.09 |
| 134.9 | 0.087 |
| 135.0 | 0.089 |
| 135.1 | 0.09 |
| 135.2 | 0.092 |
| 135.3 | 0.09 |
| 135.4 | 0.092 |
| 135.5 | 0.087 |
| 135.6 | 0.092 |
| 135.7 | 0.093 |
| 135.8 | 0.093 |
| 135.9 | 0.09 |
| 136.0 | 0.087 |
| 136.1 | 0.088 |
| 136.2 | 0.079 |
| 136.3 | 0.092 |
| 136.4 | 0.082 |
| 136.5 | 0.093 |
| 136.6 | 0.09 |
| 136.7 | 0.092 |
| 136.8 | 0.095 |
| 136.9 | 0.093 |
| 137.0 | 0.094 |
| 137.1 | 0.092 |
| 137.2 | 0.086 |
| 137.3 | 0.091 |
| 137.4 | 0.09 |
| 137.5 | 0.089 |
| 137.6 | 0.089 |
| 137.7 | 0.091 |
| 137.8 | 0.089 |
| 137.9 | 0.09 |
| 138.0 | 0.087 |
| 138.1 | 0.091 |
| 138.2 | 0.095 |
| 138.3 | 0.092 |
| 138.4 | 0.08 |
| 138.5 | 0.086 |
| 138.6 | 0.085 |
| 138.7 | 0.082 |
| 138.8 | 0.082 |
| 138.9 | 0.08 |
| 139.0 | 0.081 |
| 139.1 | 0.083 |
| 139.2 | 0.078 |
| 139.3 | 0.076 |
| 139.4 | 0.079 |
| 139.5 | 0.074 |
| 139.6 | 0.075 |
| 139.7 | 0.074 |
| 139.8 | 0.075 |
| 139.9 | 0.074 |
| 140.0 | 0.075 |
| 140.1 | 0.068 |
| 140.2 | 0.07 |
| 140.3 | 0.077 |
| 140.4 | 0.072 |
| 140.5 | 0.067 |
| 140.6 | 0.067 |
| 140.7 | 0.067 |
| 140.8 | 0.066 |
| 140.9 | 0.066 |
| 141.0 | 0.068 |
| 141.1 | 0.059 |
| 141.2 | 0.059 |
| 141.3 | 0.058 |
| 141.4 | 0.059 |
| 141.5 | 0.057 |
| 141.6 | 0.058 |
| 141.7 | 0.057 |
| 141.8 | 0.059 |
| 141.9 | 0.059 |
| 142.0 | 0.057 |
| 142.1 | 0.057 |
| 142.2 | 0.054 |
| 142.3 | 0.049 |
| 142.4 | 0.062 |
| 142.5 | 0.056 |
| 142.6 | 0.054 |
| 142.7 | 0.052 |
| 142.8 | 0.053 |
| 142.9 | 0.052 |
| 143.0 | 0.049 |
| 143.1 | 0.049 |
| 143.2 | 0.047 |
| 143.3 | 0.051 |
| 143.4 | 0.048 |
| 143.5 | 0.049 |
| 143.6 | 0.048 |
| 143.7 | 0.049 |
| 143.8 | 0.048 |
| 143.9 | 0.049 |
| 144.0 | 0.046 |
| 144.1 | 0.046 |
| 144.2 | 0.05 |
| 144.3 | 0.045 |
| 144.4 | 0.056 |
| 144.5 | 0.043 |
| 144.6 | 0.044 |
| 144.7 | 0.044 |
| 144.8 | 0.043 |
| 144.9 | 0.045 |
| 145.0 | 0.043 |
| 145.1 | 0.042 |
| 145.2 | 0.046 |
| 145.3 | 0.043 |
| 145.4 | 0.045 |
| 145.5 | 0.04 |
| 145.6 | 0.04 |
| 145.7 | 0.043 |
| 145.8 | 0.041 |
| 145.9 | 0.04 |
| 146.0 | 0.042 |
| 146.1 | 0.04 |
| 146.2 | 0.041 |
| 146.3 | 0.037 |
| 146.4 | 0.043 |
| 146.5 | 0.032 |
| 146.6 | 0.037 |
| 146.7 | 0.038 |
| 146.8 | 0.037 |
| 146.9 | 0.033 |
| 147.0 | 0.04 |
| 147.1 | 0.035 |
| 147.2 | 0.035 |
| 147.3 | 0.034 |
| 147.4 | 0.035 |
| 147.5 | 0.034 |
| 147.6 | 0.036 |
| 147.7 | 0.032 |
| 147.8 | 0.032 |
| 147.9 | 0.032 |
| 148.0 | 0.031 |
| 148.1 | 0.035 |
| 148.2 | 0.034 |
| 148.3 | 0.034 |
| 148.4 | 0.034 |
| 148.5 | 0.027 |
| 148.6 | 0.03 |
| 148.7 | 0.033 |
| 148.8 | 0.034 |
| 148.9 | 0.031 |
| 149.0 | 0.033 |
| 149.1 | 0.032 |
| 149.2 | 0.028 |
| 149.3 | 0.032 |
| 149.4 | 0.029 |
| 149.5 | 0.028 |
| 149.6 | 0.029 |
| 149.7 | 0.027 |
| 149.8 | 0.027 |
| 149.9 | 0.032 |
| 150.0 | 0.027 |
| 150.1 | 0.028 |
| 150.2 | 0.029 |
| 150.3 | 0.019 |
| 150.4 | 0.027 |
| 150.5 | 0.029 |
| 150.6 | 0.026 |
| 150.7 | 0.026 |
| 150.8 | 0.024 |
| 150.9 | 0.026 |
| 151.0 | 0.026 |
| 151.1 | 0.026 |
| 151.2 | 0.026 |
| 151.3 | 0.027 |
| 151.4 | 0.024 |
| 151.5 | 0.023 |
| 151.6 | 0.024 |
| 151.7 | 0.025 |
| 151.8 | 0.025 |
| 151.9 | 0.023 |
| 152.0 | 0.023 |
| 152.1 | 0.023 |
| 152.2 | 0.025 |
| 152.3 | 0.029 |
| 152.4 | 0.021 |
| 152.5 | 0.022 |
| 152.6 | 0.026 |
| 152.7 | 0.026 |
| 152.8 | 0.024 |
| 152.9 | 0.027 |
| 153.0 | 0.025 |
| 153.1 | 0.02 |
| 153.2 | 0.024 |
| 153.3 | 0.022 |
| 153.4 | 0.023 |
| 153.5 | 0.025 |
| 153.6 | 0.02 |
| 153.7 | 0.024 |
| 153.8 | 0.023 |
| 153.9 | 0.024 |
| 154.0 | 0.019 |
| 154.1 | 0.02 |
| 154.2 | 0.028 |
| 154.3 | 0.021 |
| 154.4 | 0.021 |
| 154.5 | 0.02 |
| 154.6 | 0.024 |
| 154.7 | 0.018 |
| 154.8 | 0.016 |
| 154.9 | 0.019 |
| 155.0 | 0.02 |
| 155.1 | 0.018 |
| 155.2 | 0.018 |
| 155.3 | 0.02 |
| 155.4 | 0.018 |
| 155.5 | 0.021 |
| 155.6 | 0.019 |
| 155.7 | 0.016 |
| 155.8 | 0.016 |
| 155.9 | 0.017 |
| 156.0 | 0.03 |
| 156.1 | 0.024 |
| 156.2 | 0.016 |
| 156.3 | 0.016 |
| 156.4 | 0.016 |
| 156.5 | 0.016 |
| 156.6 | 0.017 |
| 156.7 | 0.01 |
| 156.8 | 0.02 |
| 156.9 | 0.015 |
| 157.0 | 0.018 |
| 157.1 | 0.016 |
| 157.2 | 0.018 |
| 157.3 | 0.016 |
| 157.4 | 0.018 |
| 157.5 | 0.02 |
| 157.6 | 0.018 |
| 157.7 | 0.016 |
| 157.8 | 0.024 |
| 157.9 | 0.021 |
| 158.0 | 0.015 |
| 158.1 | 0.02 |
| 158.2 | 0.018 |
| 158.3 | 0.012 |
| 158.4 | 0.015 |
| 158.5 | 0.018 |
| 158.6 | 0.018 |
| 158.7 | 0.015 |
| 158.8 | 0.019 |
| 158.9 | 0.016 |
| 159.0 | 0.018 |
| 159.1 | 0.016 |
| 159.2 | 0.015 |
| 159.3 | 0.015 |
| 159.4 | 0.015 |
| 159.5 | 0.016 |
| 159.6 | 0.009 |
| 159.7 | 0.012 |
| 159.8 | 0.016 |
| 159.9 | 0.014 |
| 160.0 | 0.015 |
| 160.1 | 0.016 |
| 160.2 | 0.02 |
| 160.3 | 0.009 |
| 160.4 | 0.018 |
| 160.5 | 0.015 |
| 160.6 | 0.013 |
| 160.7 | 0.02 |
| 160.8 | 0.016 |
| 160.9 | 0.013 |
| 161.0 | 0.015 |
| 161.1 | 0.015 |
| 161.2 | 0.013 |
| 161.3 | 0.02 |
| 161.4 | 0.008 |
| 161.5 | 0.015 |
| 161.6 | 0.015 |
| 161.7 | 0.014 |
| 161.8 | 0.013 |
| 161.9 | 0.016 |
| 162.0 | 0.012 |
| 162.1 | 0.015 |
| 162.2 | 0.014 |
| 162.3 | 0.013 |
| 162.4 | 0.012 |
| 162.5 | 0.016 |
| 162.6 | 0.013 |
| 162.7 | 0.013 |
| 162.8 | 0.014 |
| 162.9 | 0.018 |
| 163.0 | 0.013 |
| 163.1 | 0.01 |
| 163.2 | 0.02 |
| 163.3 | 0.009 |
| 163.4 | 0.013 |
| 163.5 | 0.012 |
| 163.6 | 0.015 |
| 163.7 | 0.012 |
| 163.8 | 0.013 |
| 163.9 | 0.015 |
| 164.0 | 0.011 |
| 164.1 | 0.015 |
| 164.2 | 0.012 |
| 164.3 | 0.012 |
| 164.4 | 0.012 |
| 164.5 | 0.013 |
| 164.6 | 0.017 |
| 164.7 | 0.01 |
| 164.8 | 0.013 |
| 164.9 | 0.019 |
| 165.0 | 0.019 |
| 165.1 | 0.016 |
| 165.2 | 0.016 |
| 165.3 | 0.013 |
| 165.4 | 0.01 |
| 165.5 | 0.014 |
| 165.6 | 0.015 |
| 165.7 | 0.013 |
| 165.8 | 0.012 |
| 165.9 | 0.012 |
| 166.0 | 0.015 |
| 166.1 | 0.012 |
| 166.2 | 0.011 |
| 166.3 | 0.013 |
| 166.4 | 0.014 |
| 166.5 | 0.011 |
| 166.6 | 0.013 |
| 166.7 | 0.013 |
| 166.8 | 0.005 |
| 166.9 | 0.01 |
| 167.0 | 0.007 |
| 167.1 | 0.011 |
| 167.2 | 0.01 |
| 167.3 | 0.006 |
| 167.4 | 0.012 |
| 167.5 | 0.015 |
| 167.6 | 0.013 |
| 167.7 | 0.006 |
| 167.8 | 0.012 |
| 167.9 | 0.009 |
| 168.0 | 0.011 |
| 168.1 | 0.01 |
| 168.2 | 0.01 |
| 168.3 | 0.013 |
| 168.4 | 0.012 |
| 168.5 | 0.016 |
| 168.6 | 0.019 |
| 168.7 | 0.008 |
| 168.8 | 0.013 |
| 168.9 | 0.01 |
| 169.0 | 0.012 |
| 169.1 | 0.01 |
| 169.2 | 0.01 |
| 169.3 | 0.013 |
| 169.4 | 0.009 |
| 169.5 | 0.013 |
| 169.6 | 0.01 |
| 169.7 | 0.009 |
| 169.8 | 0.01 |
| 169.9 | 0.013 |
| 170.0 | 0.012 |
| 170.1 | 0.008 |
| 170.2 | 0.009 |
| 170.3 | 0.011 |
| 170.4 | 0.019 |
| 170.5 | 0.009 |
| 170.6 | 0.009 |
| 170.7 | 0.009 |
| 170.8 | 0.005 |
| 170.9 | 0.015 |
| 171.0 | 0.009 |
| 171.1 | 0.011 |
| 171.2 | 0.01 |
| 171.3 | 0.007 |
| 171.4 | 0.01 |
| 171.5 | 0.014 |
| 171.6 | 0.012 |
| 171.7 | 0.012 |
| 171.8 | 0.011 |
| 171.9 | 0.011 |
| 172.0 | 0.012 |
| 172.1 | 0.013 |
| 172.2 | 0.003 |
| 172.3 | 0.012 |
| 172.4 | 0.013 |
| 172.5 | 0.011 |
| 172.6 | 0.012 |
| 172.7 | 0.011 |
| 172.8 | 0.005 |
| 172.9 | 0.009 |
| 173.0 | 0.01 |
| 173.1 | 0.012 |
| 173.2 | 0.012 |
| 173.3 | 0.009 |
| 173.4 | 0.009 |
| 173.5 | 0.01 |
| 173.6 | 0.007 |
| 173.7 | 0.011 |
| 173.8 | 0.01 |
| 173.9 | 0.013 |
| 174.0 | 0.017 |
| 174.1 | 0.016 |
| 174.2 | 0.01 |
| 174.3 | 0.013 |
| 174.4 | 0.013 |
| 174.5 | 0.004 |
| 174.6 | 0.014 |
| 174.7 | 0.008 |
| 174.8 | 0.011 |
| 174.9 | 0.009 |
| 175.0 | 0.01 |
| 175.1 | 0.01 |
| 175.2 | 0.009 |
| 175.3 | 0.012 |
| 175.4 | 0.011 |
| 175.5 | 0.009 |
| 175.6 | 0.013 |
| 175.7 | 0.01 |
| 175.8 | 0.013 |
| 175.9 | 0.005 |
| 176.0 | 0.016 |
| 176.1 | 0.009 |
| 176.2 | 0.008 |
| 176.3 | 0.009 |
| 176.4 | 0.01 |
| 176.5 | 0.01 |
| 176.6 | 0.013 |
| 176.7 | 0.01 |
| 176.8 | 0.01 |
| 176.9 | 0.009 |
| 177.0 | 0.01 |
| 177.1 | 0.009 |
| 177.2 | 0.011 |
| 177.3 | 0.012 |
| 177.4 | 0.007 |
| 177.5 | 0.012 |
| 177.6 | 0.008 |
| 177.7 | 0.005 |
| 177.8 | 0.014 |
| 177.9 | 0.007 |
| 178.0 | 0.011 |
| 178.1 | 0.009 |
| 178.2 | 0.007 |
| 178.3 | 0.006 |
| 178.4 | 0.009 |
| 178.5 | 0.006 |
| 178.6 | 0.012 |
| 178.7 | 0.008 |
| 178.8 | 0.011 |
| 178.9 | 0.006 |
| 179.0 | 0.009 |
| 179.1 | 0.01 |
| 179.2 | 0.012 |
| 179.3 | 0.009 |
| 179.4 | 0.011 |
| 179.5 | 0.004 |
| 179.6 | 0.014 |
| 179.7 | 0.006 |
| 179.8 | 0.005 |
| 179.9 | 0.01 |
| 180.0 | 0.012 |
| 180.1 | 0.009 |
| 180.2 | 0.007 |
| 180.3 | 0.013 |
| 180.4 | 0.01 |
| 180.5 | 0.01 |
| 180.6 | 0.01 |
| 180.7 | 0.009 |
| 180.8 | 0.01 |
| 180.9 | 0.01 |
| 181.0 | 0.006 |
| 181.1 | 0.01 |
| 181.2 | 0.01 |
| 181.3 | 0.008 |
| 181.4 | 0.013 |
| 181.5 | 0.006 |
| 181.6 | 0.009 |
| 181.7 | 0.009 |
| 181.8 | 0.011 |
| 181.9 | 0.005 |
| 182.0 | 0.01 |
| 182.1 | 0.012 |
| 182.2 | 0.011 |
| 182.3 | 0.006 |
| 182.4 | 0.004 |
| 182.5 | 0.007 |
| 182.6 | 0.01 |
| 182.7 | 0.01 |
| 182.8 | 0.008 |
| 182.9 | 0.011 |
| 183.0 | 0.008 |
| 183.1 | 0.013 |
| 183.2 | 0.009 |
| 183.3 | 0.006 |
| 183.4 | 0.007 |
| 183.5 | 0.009 |
| 183.6 | 0.007 |
| 183.7 | 0.009 |
| 183.8 | 0.011 |
| 183.9 | 0.011 |
| 184.0 | 0.013 |
| 184.1 | 0.012 |
| 184.2 | 0.011 |
| 184.3 | 0.016 |
| 184.4 | 0.012 |
| 184.5 | 0.015 |
| 184.6 | 0.012 |
| 184.7 | 0.015 |
| 184.8 | 0.016 |
| 184.9 | 0.016 |
| 185.0 | 0.018 |
| 185.1 | 0.013 |
| 185.2 | 0.011 |
| 185.3 | 0.026 |
| 185.4 | 0.024 |
| 185.5 | 0.024 |
| 185.6 | 0.022 |
| 185.7 | 0.024 |
| 185.8 | 0.024 |
| 185.9 | 0.027 |
| 186.0 | 0.031 |
| 186.1 | 0.03 |
| 186.2 | 0.027 |
| 186.3 | 0.029 |
| 186.4 | 0.031 |
| 186.5 | 0.034 |
| 186.6 | 0.036 |
| 186.7 | 0.034 |
| 186.8 | 0.038 |
| 186.9 | 0.033 |
| 187.0 | 0.032 |
| 187.1 | 0.044 |
| 187.2 | 0.041 |
| 187.3 | 0.04 |
| 187.4 | 0.042 |
| 187.5 | 0.046 |
| 187.6 | 0.046 |
| 187.7 | 0.048 |
| 187.8 | 0.051 |
| 187.9 | 0.048 |
| 188.0 | 0.051 |
| 188.1 | 0.049 |
| 188.2 | 0.05 |
| 188.3 | 0.052 |
| 188.4 | 0.053 |
| 188.5 | 0.056 |
| 188.6 | 0.055 |
| 188.7 | 0.054 |
| 188.8 | 0.069 |
| 188.9 | 0.064 |
| 189.0 | 0.057 |
| 189.1 | 0.063 |
| 189.2 | 0.065 |
| 189.3 | 0.06 |
| 189.4 | 0.059 |
| 189.5 | 0.067 |
| 189.6 | 0.065 |
| 189.7 | 0.063 |
| 189.8 | 0.069 |
| 189.9 | 0.068 |
| 190.0 | 0.068 |
| 190.1 | 0.068 |
| 190.2 | 0.069 |
| 190.3 | 0.068 |
| 190.4 | 0.07 |
| 190.5 | 0.074 |
| 190.6 | 0.078 |
| 190.7 | 0.065 |
| 190.8 | 0.07 |
| 190.9 | 0.074 |
| 191.0 | 0.073 |
| 191.1 | 0.074 |
| 191.2 | 0.076 |
| 191.3 | 0.079 |
| 191.4 | 0.077 |
| 191.5 | 0.077 |
| 191.6 | 0.076 |
| 191.7 | 0.078 |
| 191.8 | 0.08 |
| 191.9 | 0.081 |
| 192.0 | 0.078 |
| 192.1 | 0.077 |
| 192.2 | 0.08 |
| 192.3 | 0.082 |
| 192.4 | 0.078 |
| 192.5 | 0.079 |
| 192.6 | 0.082 |
| 192.7 | 0.079 |
| 192.8 | 0.083 |
| 192.9 | 0.089 |
| 193.0 | 0.085 |
| 193.1 | 0.081 |
| 193.2 | 0.082 |
| 193.3 | 0.079 |
| 193.4 | 0.082 |
| 193.5 | 0.083 |
| 193.6 | 0.087 |
| 193.7 | 0.083 |
| 193.8 | 0.084 |
| 193.9 | 0.084 |
| 194.0 | 0.085 |
| 194.1 | 0.083 |
| 194.2 | 0.084 |
| 194.3 | 0.082 |
| 194.4 | 0.093 |
| 194.5 | 0.089 |
| 194.6 | 0.089 |
| 194.7 | 0.086 |
| 194.8 | 0.081 |
| 194.9 | 0.087 |
| 195.0 | 0.081 |
| 195.1 | 0.088 |
| 195.2 | 0.089 |
| 195.3 | 0.09 |
| 195.4 | 0.089 |
| 195.5 | 0.089 |
| 195.6 | 0.09 |
| 195.7 | 0.09 |
| 195.8 | 0.09 |
| 195.9 | 0.089 |
| 196.0 | 0.091 |
| 196.1 | 0.098 |
| 196.2 | 0.094 |
| 196.3 | 0.088 |
| 196.4 | 0.091 |
| 196.5 | 0.086 |
| 196.6 | 0.086 |
| 196.7 | 0.096 |
| 196.8 | 0.092 |
| 196.9 | 0.092 |
| 197.0 | 0.089 |
| 197.1 | 0.091 |
| 197.2 | 0.09 |
| 197.3 | 0.088 |
| 197.4 | 0.091 |
| 197.5 | 0.092 |
| 197.6 | 0.092 |
| 197.7 | 0.093 |
| 197.8 | 0.095 |
| 197.9 | 0.084 |
| 198.0 | 0.095 |
| 198.1 | 0.093 |
| 198.2 | 0.09 |
| 198.3 | 0.091 |
| 198.4 | 0.091 |
| 198.5 | 0.093 |
| 198.6 | 0.09 |
| 198.7 | 0.089 |
| 198.8 | 0.092 |
| 198.9 | 0.092 |
| 199.0 | 0.09 |
| 199.1 | 0.092 |
| 199.2 | 0.091 |
| 199.3 | 0.09 |
| 199.4 | 0.09 |
| 199.5 | 0.091 |
| 199.6 | 0.096 |
| 199.7 | 0.085 |
| 199.8 | 0.089 |
| 199.9 | 0.092 |
| 200.0 | 0.09 |
| 200.1 | 0.095 |
| 200.2 | 0.09 |
| 200.3 | 0.092 |
| 200.4 | 0.086 |
| 200.5 | 0.093 |
| 200.6 | 0.091 |
| 200.7 | 0.092 |
| 200.8 | 0.094 |
| 200.9 | 0.09 |
| 201.0 | 0.092 |
| 201.1 | 0.095 |
| 201.2 | 0.088 |
| 201.3 | 0.098 |
| 201.4 | 0.099 |
| 201.5 | 0.087 |
| 201.6 | 0.089 |
| 201.7 | 0.093 |
| 201.8 | 0.095 |
| 201.9 | 0.091 |
| 202.0 | 0.093 |
| 202.1 | 0.095 |
| 202.2 | 0.091 |
| 202.3 | 0.092 |
| 202.4 | 0.094 |
| 202.5 | 0.093 |
| 202.6 | 0.092 |
| 202.7 | 0.091 |
| 202.8 | 0.093 |
| 202.9 | 0.094 |
| 203.0 | 0.092 |
| 203.1 | 0.087 |
| 203.2 | 0.093 |
| 203.3 | 0.094 |
| 203.4 | 0.093 |
| 203.5 | 0.089 |
| 203.6 | 0.094 |
| 203.7 | 0.09 |
| 203.8 | 0.096 |
| 203.9 | 0.09 |
| 204.0 | 0.097 |
| 204.1 | 0.092 |
| 204.2 | 0.094 |
| 204.3 | 0.092 |
| 204.4 | 0.094 |
| 204.5 | 0.092 |
| 204.6 | 0.098 |
| 204.7 | 0.093 |
| 204.8 | 0.087 |
| 204.9 | 0.084 |
| 205.0 | 0.094 |
| 205.1 | 0.091 |
| 205.2 | 0.091 |
| 205.3 | 0.093 |
| 205.4 | 0.093 |
| 205.5 | 0.093 |
| 205.6 | 0.092 |
| 205.7 | 0.09 |
| 205.8 | 0.091 |
| 205.9 | 0.087 |
| 206.0 | 0.091 |
| 206.1 | 0.092 |
| 206.2 | 0.094 |
| 206.3 | 0.092 |
| 206.4 | 0.091 |
| 206.5 | 0.084 |
| 206.6 | 0.095 |
| 206.7 | 0.089 |
| 206.8 | 0.095 |
| 206.9 | 0.095 |
| 207.0 | 0.095 |
| 207.1 | 0.092 |
| 207.2 | 0.084 |
| 207.3 | 0.085 |
| 207.4 | 0.095 |
| 207.5 | 0.091 |
| 207.6 | 0.089 |
| 207.7 | 0.093 |
| 207.8 | 0.09 |
| 207.9 | 0.092 |
| 208.0 | 0.095 |
| 208.1 | 0.092 |
| 208.2 | 0.09 |
| 208.3 | 0.095 |
| 208.4 | 0.088 |
| 208.5 | 0.094 |
| 208.6 | 0.089 |
| 208.7 | 0.093 |
| 208.8 | 0.093 |
| 208.9 | 0.09 |
| 209.0 | 0.091 |
| 209.1 | 0.089 |
| 209.2 | 0.089 |
| 209.3 | 0.091 |
| 209.4 | 0.093 |
| 209.5 | 0.093 |
| 209.6 | 0.092 |
| 209.7 | 0.09 |
| 209.8 | 0.094 |
| 209.9 | 0.091 |
| 210.0 | 0.092 |
| 210.1 | 0.099 |
| 210.2 | 0.091 |
| 210.3 | 0.091 |
| 210.4 | 0.089 |
| 210.5 | 0.093 |
| 210.6 | 0.09 |
| 210.7 | 0.09 |
| 210.8 | 0.089 |
| 210.9 | 0.087 |
| 211.0 | 0.09 |
| 211.1 | 0.086 |
| 211.2 | 0.089 |
| 211.3 | 0.094 |
| 211.4 | 0.089 |
| 211.5 | 0.093 |
| 211.6 | 0.094 |
| 211.7 | 0.09 |
| 211.8 | 0.09 |
| 211.9 | 0.089 |
| 212.0 | 0.092 |
| 212.1 | 0.096 |
| 212.2 | 0.087 |
| 212.3 | 0.093 |
| 212.4 | 0.091 |
| 212.5 | 0.092 |
| 212.6 | 0.089 |
| 212.7 | 0.089 |
| 212.8 | 0.092 |
| 212.9 | 0.09 |
| 213.0 | 0.09 |
| 213.1 | 0.092 |
| 213.2 | 0.092 |
| 213.3 | 0.091 |
| 213.4 | 0.088 |
| 213.5 | 0.093 |
| 213.6 | 0.089 |
| 213.7 | 0.092 |
| 213.8 | 0.083 |
| 213.9 | 0.096 |
| 214.0 | 0.094 |
| 214.1 | 0.089 |
| 214.2 | 0.091 |
| 214.3 | 0.089 |
| 214.4 | 0.092 |
| 214.5 | 0.089 |
| 214.6 | 0.084 |
| 214.7 | 0.089 |
| 214.8 | 0.089 |
| 214.9 | 0.093 |
| 215.0 | 0.089 |
| 215.1 | 0.088 |
| 215.2 | 0.093 |
| 215.3 | 0.093 |
| 215.4 | 0.092 |
| 215.5 | 0.092 |
| 215.6 | 0.095 |
| 215.7 | 0.089 |
| 215.8 | 0.098 |
| 215.9 | 0.096 |
| 216.0 | 0.098 |
| 216.1 | 0.092 |
| 216.2 | 0.089 |
| 216.3 | 0.09 |
| 216.4 | 0.091 |
| 216.5 | 0.09 |
| 216.6 | 0.089 |
| 216.7 | 0.093 |
| 216.8 | 0.09 |
| 216.9 | 0.09 |
| 217.0 | 0.089 |
| 217.1 | 0.09 |
| 217.2 | 0.09 |
| 217.3 | 0.09 |
| 217.4 | 0.088 |
| 217.5 | 0.088 |
| 217.6 | 0.093 |
| 217.7 | 0.087 |
| 217.8 | 0.084 |
| 217.9 | 0.095 |
| 218.0 | 0.095 |
| 218.1 | 0.092 |
| 218.2 | 0.09 |
| 218.3 | 0.092 |
| 218.4 | 0.086 |
| 218.5 | 0.087 |
| 218.6 | 0.09 |
| 218.7 | 0.092 |
| 218.8 | 0.087 |
| 218.9 | 0.089 |
| 219.0 | 0.092 |
| 219.1 | 0.091 |
| 219.2 | 0.092 |
| 219.3 | 0.088 |
| 219.4 | 0.091 |
| 219.5 | 0.087 |
| 219.6 | 0.09 |
| 219.7 | 0.092 |
| 219.8 | 0.093 |
| 219.9 | 0.083 |
| 220.0 | 0.092 |
| 220.1 | 0.095 |
| 220.2 | 0.089 |
| 220.3 | 0.092 |
| 220.4 | 0.09 |
| 220.5 | 0.089 |
| 220.6 | 0.091 |
| 220.7 | 0.086 |
| 220.8 | 0.092 |
| 220.9 | 0.089 |
| 221.0 | 0.09 |
| 221.1 | 0.09 |
| 221.2 | 0.092 |
| 221.3 | 0.09 |
| 221.4 | 0.089 |
| 221.5 | 0.089 |
| 221.6 | 0.088 |
| 221.7 | 0.088 |
| 221.8 | 0.087 |
| 221.9 | 0.09 |
| 222.0 | 0.088 |
| 222.1 | 0.09 |
| 222.2 | 0.099 |
| 222.3 | 0.083 |
| 222.4 | 0.096 |
| 222.5 | 0.091 |
| 222.6 | 0.087 |
| 222.7 | 0.091 |
| 222.8 | 0.09 |
| 222.9 | 0.085 |
| 223.0 | 0.089 |
| 223.1 | 0.093 |
| 223.2 | 0.089 |
| 223.3 | 0.082 |
| 223.4 | 0.089 |
| 223.5 | 0.091 |
| 223.6 | 0.089 |
| 223.7 | 0.09 |
| 223.8 | 0.092 |
| 223.9 | 0.09 |
| 224.0 | 0.09 |
| 224.1 | 0.089 |
| 224.2 | 0.087 |
| 224.3 | 0.084 |
| 224.4 | 0.092 |
| 224.5 | 0.09 |
| 224.6 | 0.085 |
| 224.7 | 0.083 |
| 224.8 | 0.083 |
| 224.9 | 0.082 |
| 225.0 | 0.079 |
| 225.1 | 0.079 |
| 225.2 | 0.075 |
| 225.3 | 0.078 |
| 225.4 | 0.074 |
| 225.5 | 0.07 |
| 225.6 | 0.073 |
| 225.7 | 0.074 |
| 225.8 | 0.071 |
| 225.9 | 0.07 |
| 226.0 | 0.069 |
| 226.1 | 0.069 |
| 226.2 | 0.07 |
| 226.3 | 0.066 |
| 226.4 | 0.067 |
| 226.5 | 0.065 |
| 226.6 | 0.065 |
| 226.7 | 0.054 |
| 226.8 | 0.057 |
| 226.9 | 0.062 |
| 227.0 | 0.059 |
| 227.1 | 0.057 |
| 227.2 | 0.06 |
| 227.3 | 0.053 |
| 227.4 | 0.053 |
| 227.5 | 0.054 |
| 227.6 | 0.063 |
| 227.7 | 0.059 |
| 227.8 | 0.056 |
| 227.9 | 0.054 |
| 228.0 | 0.055 |
| 228.1 | 0.054 |
| 228.2 | 0.054 |
| 228.3 | 0.054 |
| 228.4 | 0.054 |
| 228.5 | 0.054 |
| 228.6 | 0.054 |
| 228.7 | 0.051 |
| 228.8 | 0.052 |
| 228.9 | 0.038 |
| 229.0 | 0.047 |
| 229.1 | 0.045 |
| 229.2 | 0.053 |
| 229.3 | 0.046 |
| 229.4 | 0.05 |
| 229.5 | 0.047 |
| 229.6 | 0.043 |
| 229.7 | 0.045 |
| 229.8 | 0.049 |
| 229.9 | 0.045 |
| 230.0 | 0.045 |
| 230.1 | 0.043 |
| 230.2 | 0.045 |
| 230.3 | 0.043 |
| 230.4 | 0.045 |
| 230.5 | 0.046 |
| 230.6 | 0.045 |
| 230.7 | 0.042 |
| 230.8 | 0.042 |
| 230.9 | 0.043 |
| 231.0 | 0.041 |
| 231.1 | 0.041 |
| 231.2 | 0.035 |
| 231.3 | 0.034 |
| 231.4 | 0.034 |
| 231.5 | 0.041 |
| 231.6 | 0.038 |
| 231.7 | 0.043 |
| 231.8 | 0.038 |
| 231.9 | 0.043 |
| 232.0 | 0.035 |
| 232.1 | 0.043 |
| 232.2 | 0.032 |
| 232.3 | 0.041 |
| 232.4 | 0.039 |
| 232.5 | 0.034 |
| 232.6 | 0.034 |
| 232.7 | 0.038 |
| 232.8 | 0.035 |
| 232.9 | 0.037 |
| 233.0 | 0.035 |
| 233.1 | 0.034 |
| 233.2 | 0.033 |
| 233.3 | 0.034 |
| 233.4 | 0.038 |
| 233.5 | 0.042 |
| 233.6 | 0.027 |
| 233.7 | 0.031 |
| 233.8 | 0.034 |
| 233.9 | 0.032 |
| 234.0 | 0.032 |
| 234.1 | 0.032 |
| 234.2 | 0.03 |
| 234.3 | 0.033 |
| 234.4 | 0.029 |
| 234.5 | 0.034 |
| 234.6 | 0.029 |
| 234.7 | 0.029 |
| 234.8 | 0.026 |
| 234.9 | 0.029 |
| 235.0 | 0.026 |
| 235.1 | 0.029 |
| 235.2 | 0.026 |
| 235.3 | 0.031 |
| 235.4 | 0.027 |
| 235.5 | 0.027 |
| 235.6 | 0.032 |
| 235.7 | 0.021 |
| 235.8 | 0.02 |
| 235.9 | 0.026 |
| 236.0 | 0.026 |
| 236.1 | 0.028 |
| 236.2 | 0.024 |
| 236.3 | 0.028 |
| 236.4 | 0.027 |
| 236.5 | 0.024 |
| 236.6 | 0.027 |
| 236.7 | 0.024 |
| 236.8 | 0.026 |
| 236.9 | 0.024 |
| 237.0 | 0.026 |
| 237.1 | 0.023 |
| 237.2 | 0.023 |
| 237.3 | 0.021 |
| 237.4 | 0.025 |
| 237.5 | 0.024 |
| 237.6 | 0.024 |
| 237.7 | 0.024 |
| 237.8 | 0.025 |
| 237.9 | 0.016 |
| 238.0 | 0.018 |
| 238.1 | 0.018 |
| 238.2 | 0.02 |
| 238.3 | 0.022 |
| 238.4 | 0.024 |
| 238.5 | 0.021 |
| 238.6 | 0.019 |
| 238.7 | 0.023 |
| 238.8 | 0.02 |
| 238.9 | 0.02 |
| 239.0 | 0.02 |
| 239.1 | 0.02 |
| 239.2 | 0.024 |
| 239.3 | 0.024 |
| 239.4 | 0.019 |
| 239.5 | 0.023 |
| 239.6 | 0.022 |
| 239.7 | 0.021 |
| 239.8 | 0.02 |
| 239.9 | 0.02 |
| 240.0 | 0.02 |
| 240.1 | 0.024 |
| 240.2 | 0.028 |
| 240.3 | 0.022 |
| 240.4 | 0.021 |
| 240.5 | 0.019 |
| 240.6 | 0.016 |
| 240.7 | 0.017 |
| 240.8 | 0.017 |
| 240.9 | 0.022 |
| 241.0 | 0.02 |
| 241.1 | 0.024 |
| 241.2 | 0.014 |
| 241.3 | 0.017 |
| 241.4 | 0.015 |
| 241.5 | 0.02 |
| 241.6 | 0.018 |
| 241.7 | 0.018 |
| 241.8 | 0.016 |
| 241.9 | 0.019 |
| 242.0 | 0.02 |
| 242.1 | 0.021 |
| 242.2 | 0.018 |
| 242.3 | 0.02 |
| 242.4 | 0.016 |
| 242.5 | 0.013 |
| 242.6 | 0.015 |
| 242.7 | 0.024 |
| 242.8 | 0.017 |
| 242.9 | 0.016 |
| 243.0 | 0.016 |
| 243.1 | 0.018 |
| 243.2 | 0.018 |
| 243.3 | 0.02 |
| 243.4 | 0.014 |
| 243.5 | 0.02 |
| 243.6 | 0.016 |
| 243.7 | 0.02 |
| 243.8 | 0.016 |
| 243.9 | 0.016 |
| 244.0 | 0.02 |
| 244.1 | 0.016 |
| 244.2 | 0.015 |
| 244.3 | 0.018 |
| 244.4 | 0.018 |
| 244.5 | 0.015 |
| 244.6 | 0.013 |
| 244.7 | 0.017 |
| 244.8 | 0.017 |
| 244.9 | 0.014 |
| 245.0 | 0.013 |
| 245.1 | 0.015 |
| 245.2 | 0.015 |
| 245.3 | 0.024 |
| 245.4 | 0.018 |
| 245.5 | 0.016 |
| 245.6 | 0.011 |
| 245.7 | 0.013 |
| 245.8 | 0.014 |
| 245.9 | 0.013 |
| 246.0 | 0.016 |
| 246.1 | 0.017 |
| 246.2 | 0.021 |
| 246.3 | 0.009 |
| 246.4 | 0.013 |
| 246.5 | 0.011 |
| 246.6 | 0.013 |
| 246.7 | 0.01 |
| 246.8 | 0.011 |
| 246.9 | 0.018 |
| 247.0 | 0.015 |
| 247.1 | 0.012 |
| 247.2 | 0.013 |
| 247.3 | 0.015 |
| 247.4 | 0.015 |
| 247.5 | 0.015 |
| 247.6 | 0.013 |
| 247.7 | 0.012 |
| 247.8 | 0.014 |
| 247.9 | 0.012 |
| 248.0 | 0.016 |
| 248.1 | 0.011 |
| 248.2 | 0.007 |
| 248.3 | 0.012 |
| 248.4 | 0.004 |
| 248.5 | 0.013 |
| 248.6 | 0.008 |
| 248.7 | 0.015 |
| 248.8 | 0.015 |
| 248.9 | 0.015 |
| 249.0 | 0.012 |
| 249.1 | 0.011 |
| 249.2 | 0.009 |
| 249.3 | 0.012 |
| 249.4 | 0.014 |
| 249.5 | 0.009 |
| 249.6 | 0.014 |
| 249.7 | 0.013 |
| 249.8 | 0.014 |
| 249.9 | 0.016 |
| 250.0 | 0.013 |
| 250.1 | 0.013 |
| 250.2 | 0.011 |
| 250.3 | 0.014 |
| 250.4 | 0.01 |
| 250.5 | 0.013 |
| 250.6 | 0.009 |
| 250.7 | 0.014 |
| 250.8 | 0.015 |
| 250.9 | 0.01 |
| 251.0 | 0.011 |
| 251.1 | 0.01 |
| 251.2 | 0.012 |
| 251.3 | 0.011 |
| 251.4 | 0.013 |
| 251.5 | 0.011 |
| 251.6 | 0.005 |
| 251.7 | 0.005 |
| 251.8 | 0.005 |
| 251.9 | 0.01 |
| 252.0 | 0.009 |
| 252.1 | 0.015 |
| 252.2 | 0.012 |
| 252.3 | 0.013 |
| 252.4 | 0.009 |
| 252.5 | 0.004 |
| 252.6 | 0.014 |
| 252.7 | 0.006 |
| 252.8 | 0.009 |
| 252.9 | 0.018 |
| 253.0 | 0.008 |
| 253.1 | 0.011 |
| 253.2 | 0.008 |
| 253.3 | 0.011 |
| 253.4 | 0.012 |
| 253.5 | 0.01 |
| 253.6 | 0.01 |
| 253.7 | 0.012 |
| 253.8 | 0.011 |
| 253.9 | 0.01 |
| 254.0 | 0.012 |
| 254.1 | 0.012 |
| 254.2 | 0.008 |
| 254.3 | 0.011 |
| 254.4 | 0.01 |
| 254.5 | 0.013 |
| 254.6 | 0.007 |
| 254.7 | 0.009 |
| 254.8 | 0.02 |
| 254.9 | 0.016 |
| 255.0 | 0.013 |
| 255.1 | 0.004 |
| 255.2 | 0.012 |
| 255.3 | 0.01 |
| 255.4 | 0.007 |
| 255.5 | 0.011 |
| 255.6 | 0.012 |
| 255.7 | 0.013 |
| 255.8 | 0.01 |
| 255.9 | 0.009 |
| 256.0 | 0.011 |
| 256.1 | 0.014 |
| 256.2 | 0.008 |
| 256.3 | 0.009 |
| 256.4 | 0.011 |
| 256.5 | 0.011 |
| 256.6 | 0.01 |
| 256.7 | 0.007 |
| 256.8 | 0.011 |
| 256.9 | 0.01 |
| 257.0 | 0.01 |
| 257.1 | 0.01 |
| 257.2 | 0.009 |
| 257.3 | 0.012 |
| 257.4 | 0.011 |
| 257.5 | 0.009 |
| 257.6 | 0.011 |
| 257.7 | 0.012 |
| 257.8 | 0.012 |
| 257.9 | 0.009 |
| 258.0 | 0.007 |
| 258.1 | 0.009 |
| 258.2 | 0.012 |
| 258.3 | 0.004 |
| 258.4 | 0.003 |
| 258.5 | 0.004 |
| 258.6 | 0.013 |
| 258.7 | 0.01 |
| 258.8 | 0.009 |
| 258.9 | 0.009 |
| 259.0 | 0.005 |
| 259.1 | 0.008 |
| 259.2 | 0.01 |
| 259.3 | 0.012 |
| 259.4 | 0.013 |
| 259.5 | 0.014 |
| 259.6 | 0.01 |
| 259.7 | 0.009 |
| 259.8 | 0.015 |
| 259.9 | 0.011 |
| 260.0 | 0.01 |
| 260.1 | 0.01 |
| 260.2 | 0.008 |
| 260.3 | 0.009 |
| 260.4 | 0.008 |
| 260.5 | 0.01 |
| 260.6 | 0.008 |
| 260.7 | 0.009 |
| 260.8 | 0.009 |
| 260.9 | 0.01 |
| 261.0 | 0.01 |
| 261.1 | 0.01 |
| 261.2 | 0.009 |
| 261.3 | 0.011 |
| 261.4 | 0.009 |
| 261.5 | 0.007 |
| 261.6 | 0.012 |
| 261.7 | 0.006 |
| 261.8 | 0.013 |
| 261.9 | 0.005 |
| 262.0 | 0.012 |
| 262.1 | 0.009 |
| 262.2 | 0.007 |
| 262.3 | 0.009 |
| 262.4 | 0.012 |
| 262.5 | 0.01 |
| 262.6 | 0.01 |
| 262.7 | 0.005 |
| 262.8 | 0.004 |
| 262.9 | 0.013 |
| 263.0 | 0.007 |
| 263.1 | 0.009 |
| 263.2 | 0.007 |
| 263.3 | 0.009 |
| 263.4 | 0.007 |
| 263.5 | 0.009 |
| 263.6 | 0.007 |
| 263.7 | 0.008 |
| 263.8 | 0.009 |
| 263.9 | 0.009 |
| 264.0 | 0.01 |
| 264.1 | 0.009 |
| 264.2 | 0.01 |
| 264.3 | 0.012 |
| 264.4 | 0.009 |
| 264.5 | 0.013 |
| 264.6 | 0.009 |
| 264.7 | 0.012 |
| 264.8 | 0.008 |
| 264.9 | 0.001 |
| 265.0 | 0.011 |
| 265.1 | 0.009 |
| 265.2 | 0.013 |
| 265.3 | 0.01 |
| 265.4 | 0.008 |
| 265.5 | 0.008 |
| 265.6 | 0.01 |
| 265.7 | 0.012 |
| 265.8 | 0.003 |
| 265.9 | 0.005 |
| 266.0 | 0.01 |
| 266.1 | 0.011 |
| 266.2 | 0.013 |
| 266.3 | 0.016 |
| 266.4 | 0.014 |
| 266.5 | 0.006 |
| 266.6 | 0.005 |
| 266.7 | 0.012 |
| 266.8 | 0.008 |
| 266.9 | 0.011 |
| 267.0 | 0.008 |
| 267.1 | 0.009 |
| 267.2 | 0.006 |
| 267.3 | 0.006 |
| 267.4 | 0.01 |
| 267.5 | 0.01 |
| 267.6 | 0.008 |
| 267.7 | 0.01 |
| 267.8 | 0.01 |
| 267.9 | 0.01 |
| 268.0 | 0.01 |
| 268.1 | 0.009 |
| 268.2 | 0.009 |
| 268.3 | -0.001 |
| 268.4 | 0.009 |
| 268.5 | 0.014 |
| 268.6 | 0.004 |
| 268.7 | 0.006 |
| 268.8 | 0.009 |
| 268.9 | 0.007 |
| 269.0 | 0.012 |
| 269.1 | 0.009 |
| 269.2 | 0.009 |
| 269.3 | 0.009 |
| 269.4 | 0.013 |
| 269.5 | 0.012 |
| 269.6 | 0.009 |
| 269.7 | 0.005 |
| 269.8 | 0.007 |
| 269.9 | 0.005 |
| 270.0 | 0.01 |
| 270.1 | 0.009 |
| 270.2 | 0.01 |
| 270.3 | 0.01 |
| 270.4 | 0.01 |
| 270.5 | 0.009 |
| 270.6 | 0.005 |
| 270.7 | 0.009 |
| 270.8 | 0.007 |
| 270.9 | 0.006 |
| 271.0 | 0.01 |
| 271.1 | 0.007 |
| 271.2 | 0.004 |
| 271.3 | 0.009 |
| 271.4 | 0.006 |
| 271.5 | 0.011 |
| 271.6 | 0.003 |
| 271.7 | 0.02 |
| 271.8 | 0.009 |
| 271.9 | 0.002 |
| 272.0 | 0.009 |
| 272.1 | 0.005 |
| 272.2 | 0.01 |
| 272.3 | 0.012 |
| 272.4 | 0.007 |
| 272.5 | 0.005 |
| 272.6 | 0.004 |
| 272.7 | 0.008 |
| 272.8 | 0.008 |
| 272.9 | 0.005 |
| 273.0 | 0.01 |
| 273.1 | 0.007 |
| 273.2 | 0.01 |
| 273.3 | 0.012 |
| 273.4 | 0.011 |
| 273.5 | 0.007 |
| 273.6 | 0.009 |
| 273.7 | 0.01 |
| 273.8 | 0.007 |
| 273.9 | 0.008 |
| 274.0 | 0.006 |
| 274.1 | 0.009 |
| 274.2 | 0.009 |
| 274.3 | 0.009 |
| 274.4 | 0.009 |
| 274.5 | 0.007 |
| 274.6 | 0.01 |
| 274.7 | 0.005 |
| 274.8 | 0.001 |
| 274.9 | 0.019 |
| 275.0 | 0.017 |
| 275.1 | 0.014 |
| 275.2 | 0.005 |
| 275.3 | 0.009 |
| 275.4 | 0.009 |
| 275.5 | 0.006 |
| 275.6 | 0.007 |
| 275.7 | 0.009 |
| 275.8 | 0.009 |
| 275.9 | 0.008 |
| 276.0 | 0.004 |
| 276.1 | 0.012 |
| 276.2 | 0.008 |
| 276.3 | 0.009 |
| 276.4 | 0.008 |
| 276.5 | 0.008 |
| 276.6 | 0.009 |
| 276.7 | 0.011 |
| 276.8 | 0.007 |
| 276.9 | 0.011 |
| 277.0 | 0.007 |
| 277.1 | 0.007 |
| 277.2 | 0.004 |
| 277.3 | 0.007 |
| 277.4 | 0.012 |
| 277.5 | 0.01 |
| 277.6 | 0.011 |
| 277.7 | 0.008 |
| 277.8 | 0.01 |
| 277.9 | 0.009 |
| 278.0 | 0.007 |
| 278.1 | 0.013 |
| 278.2 | 0.001 |
| 278.3 | -0.001 |
| 278.4 | 0.001 |
| 278.5 | 0.015 |
| 278.6 | 0 |
| 278.7 | 0.01 |
| 278.8 | 0.007 |
| 278.9 | 0.009 |
| 279.0 | 0.008 |
| 279.1 | 0.01 |
| 279.2 | 0.008 |
| 279.3 | 0.009 |
| 279.4 | 0.01 |
| 279.5 | 0.01 |
| 279.6 | 0.007 |
| 279.7 | 0.003 |
| 279.8 | 0.012 |
| 279.9 | 0.012 |
| 280.0 | 0.009 |
| 280.1 | 0.01 |
| 280.2 | 0.009 |
| 280.3 | 0.015 |
| 280.4 | 0.005 |
| 280.5 | 0.005 |
| 280.6 | 0.01 |
| 280.7 | 0.007 |
| 280.8 | 0.008 |
| 280.9 | 0.007 |
| 281.0 | 0.007 |
| 281.1 | 0.008 |
| 281.2 | 0.007 |
| 281.3 | 0.01 |
| 281.4 | 0.009 |
| 281.5 | 0.009 |
| 281.6 | 0.009 |
| 281.7 | 0.01 |
| 281.8 | 0.01 |
| 281.9 | 0.009 |
| 282.0 | 0.01 |
| 282.1 | 0.009 |
| 282.2 | 0.012 |
| 282.3 | 0.013 |
| 282.4 | 0.004 |
| 282.5 | 0.001 |
| 282.6 | 0.012 |
| 282.7 | 0.016 |
| 282.8 | 0.01 |
| 282.9 | 0.012 |
| 283.0 | 0.009 |
| 283.1 | 0.008 |
| 283.2 | 0.009 |
| 283.3 | 0.005 |
| 283.4 | 0.008 |
| 283.5 | 0.009 |
| 283.6 | 0.004 |
| 283.7 | 0.009 |
| 283.8 | 0.007 |
| 283.9 | 0.005 |
| 284.0 | 0.013 |
| 284.1 | 0.011 |
| 284.2 | 0.009 |
| 284.3 | 0.009 |
| 284.4 | 0.008 |
| 284.5 | 0.006 |
| 284.6 | 0.01 |
| 284.7 | 0.007 |
| 284.8 | 0.007 |
| 284.9 | 0.009 |
| 285.0 | 0.007 |
| 285.1 | 0.007 |
| 285.2 | 0.011 |
| 285.3 | 0.005 |
| 285.4 | 0.007 |
| 285.5 | 0.01 |
| 285.6 | 0.005 |
| 285.7 | 0.009 |
| 285.8 | 0.01 |
| 285.9 | 0.008 |
| 286.0 | 0.009 |
| 286.1 | 0.008 |
| 286.2 | 0.006 |
| 286.3 | 0.009 |
| 286.4 | 0.013 |
| 286.5 | 0.009 |
| 286.6 | 0.01 |
| 286.7 | 0.01 |
| 286.8 | 0.016 |
| 286.9 | 0.017 |
| 287.0 | -0.004 |
| 287.1 | 0.004 |
| 287.2 | 0.006 |
| 287.3 | 0.002 |
| 287.4 | 0.006 |
| 287.5 | 0.007 |
| 287.6 | 0.006 |
| 287.7 | 0.008 |
| 287.8 | 0.005 |
| 287.9 | 0.007 |
| 288.0 | 0.005 |
| 288.1 | 0.007 |
| 288.2 | 0.01 |
| 288.3 | 0.007 |
| 288.4 | 0.016 |
| 288.5 | 0.005 |
| 288.6 | 0.007 |
| 288.7 | 0.005 |
| 288.8 | 0.007 |
| 288.9 | 0.005 |
| 289.0 | 0.009 |
| 289.1 | 0.008 |
| 289.2 | 0.007 |
| 289.3 | 0.011 |
| 289.4 | 0.007 |
| 289.5 | 0.009 |
| 289.6 | 0.009 |
| 289.7 | 0.009 |
| 289.8 | 0.005 |
| 289.9 | 0.007 |
| 290.0 | 0.007 |
| 290.1 | 0.009 |
| 290.2 | 0.008 |
| 290.3 | 0.007 |
| 290.4 | 0.006 |
| 290.5 | 0.009 |
| 290.6 | 0.005 |
| 290.7 | 0.013 |
| 290.8 | 0.001 |
| 290.9 | 0.004 |
| 291.0 | 0.01 |
| 291.1 | 0.005 |
| 291.2 | 0.005 |
| 291.3 | 0.009 |
| 291.4 | 0.009 |
| 291.5 | 0.007 |
| 291.6 | 0.007 |
| 291.7 | 0.005 |
| 291.8 | 0.006 |
| 291.9 | 0.005 |
| 292.0 | 0.009 |
| 292.1 | 0.008 |
| 292.2 | 0.012 |
| 292.3 | 0.01 |
| 292.4 | 0.01 |
| 292.5 | 0.007 |
| 292.6 | 0.009 |
| 292.7 | 0.006 |
| 292.8 | 0.007 |
| 292.9 | 0.01 |
| 293.0 | 0.007 |
| 293.1 | 0.009 |
| 293.2 | 0.009 |
| 293.3 | 0.008 |
| 293.4 | 0.006 |
| 293.5 | 0.007 |
| 293.6 | 0.007 |
| 293.7 | 0.009 |
| 293.8 | 0.01 |
| 293.9 | 0.006 |
| 294.0 | 0.01 |
| 294.1 | 0.006 |
| 294.2 | 0.006 |
| 294.3 | 0.004 |
| 294.4 | 0.018 |
| 294.5 | 0.011 |
| 294.6 | 0.01 |
| 294.7 | 0.006 |
| 294.8 | 0.013 |
| 294.9 | 0.009 |
| 295.0 | 0.01 |
| 295.1 | 0.009 |
| 295.2 | 0.015 |
| 295.3 | 0.01 |
| 295.4 | 0.016 |
| 295.5 | 0.009 |
| 295.6 | 0.014 |
| 295.7 | 0.017 |
| 295.8 | 0.018 |
| 295.9 | 0.013 |
| 296.0 | 0.02 |
| 296.1 | 0.022 |
| 296.2 | 0.017 |
| 296.3 | 0.014 |
| 296.4 | 0.015 |
| 296.5 | 0.019 |
| 296.6 | 0.023 |
| 296.7 | 0.021 |
| 296.8 | 0.025 |
| 296.9 | 0.024 |
| 297.0 | 0.027 |
| 297.1 | 0.026 |
| 297.2 | 0.029 |
| 297.3 | 0.026 |
| 297.4 | 0.03 |
| 297.5 | 0.03 |
| 297.6 | 0.032 |
| 297.7 | 0.033 |
| 297.8 | 0.037 |
| 297.9 | 0.036 |
| 298.0 | 0.043 |
| 298.1 | 0.042 |
| 298.2 | 0.034 |
| 298.3 | 0.045 |
| 298.4 | 0.04 |
| 298.5 | 0.046 |
| 298.6 | 0.044 |
| 298.7 | 0.042 |
| 298.8 | 0.047 |
| 298.9 | 0.049 |
| 299.0 | 0.048 |
| 299.1 | 0.048 |
| 299.2 | 0.053 |
| 299.3 | 0.049 |
| 299.4 | 0.056 |
| 299.5 | 0.053 |
| 299.6 | 0.054 |
| 299.7 | 0.053 |
| 299.8 | 0.055 |
| 299.9 | 0.056 |
| 300.0 | 0.056 |
| 300.1 | 0.059 |
| 300.2 | 0.059 |
| 300.3 | 0.059 |
| 300.4 | 0.063 |
| 300.5 | 0.062 |
| 300.6 | 0.06 |
| 300.7 | 0.065 |
| 300.8 | 0.062 |
| 300.9 | 0.065 |
| 301.0 | 0.067 |
| 301.1 | 0.068 |
| 301.2 | 0.066 |
| 301.3 | 0.07 |
| 301.4 | 0.069 |
| 301.5 | 0.068 |
| 301.6 | 0.067 |
| 301.7 | 0.076 |
| 301.8 | 0.063 |
| 301.9 | 0.076 |
| 302.0 | 0.067 |
| 302.1 | 0.072 |
| 302.2 | 0.073 |
| 302.3 | 0.076 |
| 302.4 | 0.076 |
| 302.5 | 0.074 |
| 302.6 | 0.077 |
| 302.7 | 0.078 |
| 302.8 | 0.069 |
| 302.9 | 0.072 |
| 303.0 | 0.082 |
| 303.1 | 0.076 |
| 303.2 | 0.077 |
| 303.3 | 0.073 |
| 303.4 | 0.074 |
| 303.5 | 0.078 |
| 303.6 | 0.079 |
| 303.7 | 0.082 |
| 303.8 | 0.079 |
| 303.9 | 0.083 |
| 304.0 | 0.082 |
| 304.1 | 0.083 |
| 304.2 | 0.082 |
| 304.3 | 0.085 |
| 304.4 | 0.081 |
| 304.5 | 0.085 |
| 304.6 | 0.085 |
| 304.7 | 0.083 |
| 304.8 | 0.084 |
| 304.9 | 0.082 |
| 305.0 | 0.082 |
| 305.1 | 0.09 |
| 305.2 | 0.081 |
| 305.3 | 0.079 |
| 305.4 | 0.086 |
| 305.5 | 0.087 |
| 305.6 | 0.089 |
| 305.7 | 0.088 |
| 305.8 | 0.087 |
| 305.9 | 0.087 |
| 306.0 | 0.084 |
| 306.1 | 0.087 |
| 306.2 | 0.086 |
| 306.3 | 0.09 |
| 306.4 | 0.088 |
| 306.5 | 0.088 |
| 306.6 | 0.092 |
| 306.7 | 0.084 |
| 306.8 | 0.089 |
| 306.9 | 0.087 |
| 307.0 | 0.089 |
| 307.1 | 0.086 |
| 307.2 | 0.089 |
| 307.3 | 0.085 |
| 307.4 | 0.092 |
| 307.5 | 0.087 |
| 307.6 | 0.089 |
| 307.7 | 0.089 |
| 307.8 | 0.089 |
| 307.9 | 0.091 |
| 308.0 | 0.09 |
| 308.1 | 0.088 |
| 308.2 | 0.092 |
| 308.3 | 0.09 |
| 308.4 | 0.091 |
| 308.5 | 0.085 |
| 308.6 | 0.078 |
| 308.7 | 0.089 |
| 308.8 | 0.089 |
| 308.9 | 0.087 |
| 309.0 | 0.092 |
| 309.1 | 0.092 |
| 309.2 | 0.091 |
| 309.3 | 0.09 |
| 309.4 | 0.09 |
| 309.5 | 0.092 |
| 309.6 | 0.089 |
| 309.7 | 0.094 |
| 309.8 | 0.093 |
| 309.9 | 0.09 |
| 310.0 | 0.093 |
| 310.1 | 0.091 |
| 310.2 | 0.087 |
| 310.3 | 0.097 |
| 310.4 | 0.092 |
| 310.5 | 0.093 |
| 310.6 | 0.09 |
| 310.7 | 0.09 |
| 310.8 | 0.095 |
| 310.9 | 0.091 |
| 311.0 | 0.091 |
| 311.1 | 0.091 |
| 311.2 | 0.093 |
| 311.3 | 0.093 |
| 311.4 | 0.095 |
| 311.5 | 0.088 |
| 311.6 | 0.093 |
| 311.7 | 0.091 |
| 311.8 | 0.085 |
| 311.9 | 0.094 |
| 312.0 | 0.099 |
| 312.1 | 0.088 |
| 312.2 | 0.095 |
| 312.3 | 0.087 |
| 312.4 | 0.092 |
| 312.5 | 0.093 |
| 312.6 | 0.093 |
| 312.7 | 0.087 |
| 312.8 | 0.092 |
| 312.9 | 0.092 |
| 313.0 | 0.095 |
| 313.1 | 0.089 |
| 313.2 | 0.091 |
| 313.3 | 0.09 |
| 313.4 | 0.089 |
| 313.5 | 0.093 |
| 313.6 | 0.092 |
| 313.7 | 0.091 |
| 313.8 | 0.092 |
| 313.9 | 0.09 |
| 314.0 | 0.09 |
| 314.1 | 0.093 |
| 314.2 | 0.092 |
| 314.3 | 0.087 |
| 314.4 | 0.092 |
| 314.5 | 0.093 |
| 314.6 | 0.094 |
| 314.7 | 0.089 |
| 314.8 | 0.096 |
| 314.9 | 0.082 |
| 315.0 | 0.094 |
| 315.1 | 0.091 |
| 315.2 | 0.089 |
| 315.3 | 0.092 |
| 315.4 | 0.09 |
| 315.5 | 0.096 |
| 315.6 | 0.095 |
| 315.7 | 0.087 |
| 315.8 | 0.091 |
| 315.9 | 0.094 |
| 316.0 | 0.089 |
| 316.1 | 0.097 |
| 316.2 | 0.087 |
| 316.3 | 0.087 |
| 316.4 | 0.091 |
| 316.5 | 0.092 |
| 316.6 | 0.092 |
| 316.7 | 0.093 |
| 316.8 | 0.093 |
| 316.9 | 0.092 |
| 317.0 | 0.092 |
| 317.1 | 0.091 |
| 317.2 | 0.093 |
| 317.3 | 0.09 |
| 317.4 | 0.092 |
| 317.5 | 0.094 |
| 317.6 | 0.095 |
| 317.7 | 0.092 |
| 317.8 | 0.098 |
| 317.9 | 0.093 |
| 318.0 | 0.089 |
| 318.1 | 0.089 |
| 318.2 | 0.092 |
| 318.3 | 0.09 |
| 318.4 | 0.089 |
| 318.5 | 0.091 |
| 318.6 | 0.093 |
| 318.7 | 0.09 |
| 318.8 | 0.094 |
| 318.9 | 0.091 |
| 319.0 | 0.091 |
| 319.1 | 0.089 |
| 319.2 | 0.09 |
| 319.3 | 0.092 |
| 319.4 | 0.093 |
| 319.5 | 0.09 |
| 319.6 | 0.09 |
| 319.7 | 0.093 |
| 319.8 | 0.091 |
| 319.9 | 0.093 |
| 320.0 | 0.088 |
| 320.1 | 0.093 |
| 320.2 | 0.092 |
| 320.3 | 0.092 |
| 320.4 | 0.092 |
| 320.5 | 0.087 |
| 320.6 | 0.095 |
| 320.7 | 0.084 |
| 320.8 | 0.09 |
| 320.9 | 0.092 |
| 321.0 | 0.089 |
| 321.1 | 0.091 |
| 321.2 | 0.089 |
| 321.3 | 0.093 |
| 321.4 | 0.089 |
| 321.5 | 0.093 |
| 321.6 | 0.095 |
| 321.7 | 0.096 |
| 321.8 | 0.092 |
| 321.9 | 0.088 |
| 322.0 | 0.087 |
| 322.1 | 0.086 |
| 322.2 | 0.092 |
| 322.3 | 0.094 |
| 322.4 | 0.092 |
| 322.5 | 0.091 |
| 322.6 | 0.089 |
| 322.7 | 0.09 |
| 322.8 | 0.092 |
| 322.9 | 0.092 |
| 323.0 | 0.09 |
| 323.1 | 0.089 |
| 323.2 | 0.095 |
| 323.3 | 0.094 |
| 323.4 | 0.092 |
| 323.5 | 0.089 |
| 323.6 | 0.09 |
| 323.7 | 0.096 |
| 323.8 | 0.099 |
| 323.9 | 0.099 |
| 324.0 | 0.096 |
| 324.1 | 0.092 |
| 324.2 | 0.091 |
| 324.3 | 0.092 |
| 324.4 | 0.092 |
| 324.5 | 0.092 |
| 324.6 | 0.089 |
| 324.7 | 0.085 |
| 324.8 | 0.09 |
| 324.9 | 0.092 |
| 325.0 | 0.089 |
| 325.1 | 0.088 |
| 325.2 | 0.09 |
| 325.3 | 0.09 |
| 325.4 | 0.092 |
| 325.5 | 0.088 |
| 325.6 | 0.09 |
| 325.7 | 0.091 |
| 325.8 | 0.089 |
| 325.9 | 0.091 |
| 326.0 | 0.09 |
| 326.1 | 0.091 |
| 326.2 | 0.089 |
| 326.3 | 0.091 |
| 326.4 | 0.091 |
| 326.5 | 0.093 |
| 326.6 | 0.09 |
| 326.7 | 0.089 |
| 326.8 | 0.094 |
| 326.9 | 0.087 |
| 327.0 | 0.093 |
| 327.1 | 0.09 |
| 327.2 | 0.082 |
| 327.3 | 0.084 |
| 327.4 | 0.093 |
| 327.5 | 0.089 |
| 327.6 | 0.088 |
| 327.7 | 0.09 |
| 327.8 | 0.091 |
| 327.9 | 0.086 |
| 328.0 | 0.089 |
| 328.1 | 0.085 |
| 328.2 | 0.085 |
| 328.3 | 0.091 |
| 328.4 | 0.09 |
| 328.5 | 0.088 |
| 328.6 | 0.086 |
| 328.7 | 0.089 |
| 328.8 | 0.087 |
| 328.9 | 0.085 |
| 329.0 | 0.091 |
| 329.1 | 0.088 |
| 329.2 | 0.092 |
| 329.3 | 0.091 |
| 329.4 | 0.089 |
| 329.5 | 0.092 |
| 329.6 | 0.09 |
| 329.7 | 0.086 |
| 329.8 | 0.09 |
| 329.9 | 0.092 |
| 330.0 | 0.088 |
| 330.1 | 0.085 |
| 330.2 | 0.085 |
| 330.3 | 0.088 |
| 330.4 | 0.086 |
| 330.5 | 0.087 |
| 330.6 | 0.079 |
| 330.7 | 0.082 |
| 330.8 | 0.095 |
| 330.9 | 0.084 |
| 331.0 | 0.091 |
| 331.1 | 0.089 |
| 331.2 | 0.09 |
| 331.3 | 0.088 |
| 331.4 | 0.087 |
| 331.5 | 0.089 |
| 331.6 | 0.094 |
| 331.7 | 0.092 |
| 331.8 | 0.089 |
| 331.9 | 0.088 |
| 332.0 | 0.091 |
| 332.1 | 0.089 |
| 332.2 | 0.09 |
| 332.3 | 0.091 |
| 332.4 | 0.088 |
| 332.5 | 0.088 |
| 332.6 | 0.089 |
| 332.7 | 0.09 |
| 332.8 | 0.089 |
| 332.9 | 0.092 |
| 333.0 | 0.089 |
| 333.1 | 0.087 |
| 333.2 | 0.089 |
| 333.3 | 0.089 |
| 333.4 | 0.085 |
| 333.5 | 0.088 |
| 333.6 | 0.09 |
| 333.7 | 0.09 |
| 333.8 | 0.09 |
| 333.9 | 0.088 |
| 334.0 | 0.087 |
| 334.1 | 0.084 |
| 334.2 | 0.076 |
| 334.3 | 0.099 |
| 334.4 | 0.082 |
| 334.5 | 0.093 |
| 334.6 | 0.093 |
| 334.7 | 0.09 |
| 334.8 | 0.089 |
| 334.9 | 0.09 |
| 335.0 | 0.089 |
| 335.1 | 0.091 |
| 335.2 | 0.09 |
| 335.3 | 0.088 |
| 335.4 | 0.089 |
| 335.5 | 0.082 |
| 335.6 | 0.085 |
| 335.7 | 0.088 |
| 335.8 | 0.085 |
| 335.9 | 0.094 |
| 336.0 | 0.089 |
| 336.1 | 0.087 |
| 336.2 | 0.084 |
| 336.3 | 0.093 |
| 336.4 | 0.089 |
| 336.5 | 0.091 |
| 336.6 | 0.088 |
| 336.7 | 0.088 |
| 336.8 | 0.089 |
| 336.9 | 0.087 |
| 337.0 | 0.087 |
| 337.1 | 0.089 |
| 337.2 | 0.089 |
| 337.3 | 0.085 |
| 337.4 | 0.087 |
| 337.5 | 0.089 |
| 337.6 | 0.087 |
| 337.7 | 0.085 |
| 337.8 | 0.09 |
| 337.9 | 0.087 |
| 338.0 | 0.087 |
| 338.1 | 0.088 |
| 338.2 | 0.084 |
| 338.3 | 0.08 |
| 338.4 | 0.09 |
| 338.5 | 0.081 |
| 338.6 | 0.084 |
| 338.7 | 0.084 |
| 338.8 | 0.087 |
| 338.9 | 0.09 |
| 339.0 | 0.087 |
| 339.1 | 0.087 |
| 339.2 | 0.09 |
| 339.3 | 0.087 |
| 339.4 | 0.088 |
| 339.5 | 0.087 |
| 339.6 | 0.085 |
| 339.7 | 0.085 |
| 339.8 | 0.087 |
| 339.9 | 0.088 |
| 340.0 | 0.087 |
| 340.1 | 0.09 |
| 340.2 | 0.087 |
| 340.3 | 0.088 |
| 340.4 | 0.084 |
| 340.5 | 0.085 |
| 340.6 | 0.088 |
| 340.7 | 0.085 |
| 340.8 | 0.087 |
| 340.9 | 0.086 |
| 341.0 | 0.089 |
| 341.1 | 0.087 |
| 341.2 | 0.088 |
| 341.3 | 0.089 |
| 341.4 | 0.087 |
| 341.5 | 0.088 |
| 341.6 | 0.088 |
| 341.7 | 0.092 |
| 341.8 | 0.089 |
| 341.9 | 0.085 |
| 342.0 | 0.087 |
| 342.1 | 0.084 |
| 342.2 | 0.09 |
| 342.3 | 0.09 |
| 342.4 | 0.09 |
| 342.5 | 0.089 |
| 342.6 | 0.087 |
| 342.7 | 0.089 |
| 342.8 | 0.091 |
| 342.9 | 0.087 |
| 343.0 | 0.079 |
| 343.1 | 0.085 |
| 343.2 | 0.081 |
| 343.3 | 0.089 |
| 343.4 | 0.084 |
| 343.5 | 0.09 |
| 343.6 | 0.087 |
| 343.7 | 0.088 |
| 343.8 | 0.085 |
| 343.9 | 0.086 |
| 344.0 | 0.085 |
| 344.1 | 0.089 |
| 344.2 | 0.089 |
| 344.3 | 0.084 |
| 344.4 | 0.084 |
| 344.5 | 0.084 |
| 344.6 | 0.093 |
| 344.7 | 0.088 |
| 344.8 | 0.088 |
| 344.9 | 0.089 |
| 345.0 | 0.086 |
| 345.1 | 0.082 |
| 345.2 | 0.089 |
| 345.3 | 0.087 |
| 345.4 | 0.087 |
| 345.5 | 0.089 |
| 345.6 | 0.089 |
| 345.7 | 0.084 |
| 345.8 | 0.086 |
| 345.9 | 0.09 |
| 346.0 | 0.084 |
| 346.1 | 0.085 |
| 346.2 | 0.089 |
| 346.3 | 0.084 |
| 346.4 | 0.087 |
| 346.5 | 0.084 |
| 346.6 | 0.082 |
| 346.7 | 0.081 |
| 346.8 | 0.081 |
| 346.9 | 0.079 |
| 347.0 | 0.078 |
| 347.1 | 0.082 |
| 347.2 | 0.078 |
| 347.3 | 0.078 |
| 347.4 | 0.076 |
| 347.5 | 0.073 |
| 347.6 | 0.072 |
| 347.7 | 0.073 |
| 347.8 | 0.068 |
| 347.9 | 0.071 |
| 348.0 | 0.068 |
| 348.1 | 0.07 |
| 348.2 | 0.068 |
| 348.3 | 0.067 |
| 348.4 | 0.063 |
| 348.5 | 0.068 |
| 348.6 | 0.06 |
| 348.7 | 0.066 |
| 348.8 | 0.06 |
| 348.9 | 0.063 |
| 349.0 | 0.065 |
| 349.1 | 0.054 |
| 349.2 | 0.059 |
| 349.3 | 0.055 |
| 349.4 | 0.059 |
| 349.5 | 0.051 |
| 349.6 | 0.056 |
| 349.7 | 0.058 |
| 349.8 | 0.053 |
| 349.9 | 0.053 |
| 350.0 | 0.057 |
| 350.1 | 0.054 |
| 350.2 | 0.053 |
| 350.3 | 0.052 |
| 350.4 | 0.049 |
| 350.5 | 0.048 |
| 350.6 | 0.052 |
| 350.7 | 0.051 |
| 350.8 | 0.052 |
| 350.9 | 0.046 |
| 351.0 | 0.051 |
| 351.1 | 0.051 |
| 351.2 | 0.051 |
| 351.3 | 0.049 |
| 351.4 | 0.045 |
| 351.5 | 0.044 |
| 351.6 | 0.043 |
| 351.7 | 0.047 |
| 351.8 | 0.048 |
| 351.9 | 0.043 |
| 352.0 | 0.044 |
| 352.1 | 0.045 |
| 352.2 | 0.044 |
| 352.3 | 0.044 |
| 352.4 | 0.043 |
| 352.5 | 0.041 |
| 352.6 | 0.043 |
| 352.7 | 0.042 |
| 352.8 | 0.042 |
| 352.9 | 0.042 |
| 353.0 | 0.04 |
| 353.1 | 0.041 |
| 353.2 | 0.042 |
| 353.3 | 0.04 |
| 353.4 | 0.038 |
| 353.5 | 0.041 |
| 353.6 | 0.035 |
| 353.7 | 0.035 |
| 353.8 | 0.037 |
| 353.9 | 0.041 |
| 354.0 | 0.04 |
| 354.1 | 0.037 |
| 354.2 | 0.041 |
| 354.3 | 0.03 |
| 354.4 | 0.032 |
| 354.5 | 0.026 |
| 354.6 | 0.039 |
| 354.7 | 0.028 |
| 354.8 | 0.038 |
| 354.9 | 0.033 |
| 355.0 | 0.035 |
| 355.1 | 0.034 |
| 355.2 | 0.032 |
| 355.3 | 0.031 |
| 355.4 | 0.032 |
| 355.5 | 0.031 |
| 355.6 | 0.032 |
| 355.7 | 0.04 |
| 355.8 | 0.034 |
| 355.9 | 0.027 |
| 356.0 | 0.034 |
| 356.1 | 0.035 |
| 356.2 | 0.031 |
| 356.3 | 0.033 |
| 356.4 | 0.032 |
| 356.5 | 0.027 |
| 356.6 | 0.031 |
| 356.7 | 0.027 |
| 356.8 | 0.027 |
| 356.9 | 0.028 |
| 357.0 | 0.027 |
| 357.1 | 0.027 |
| 357.2 | 0.029 |
| 357.3 | 0.029 |
| 357.4 | 0.026 |
| 357.5 | 0.03 |
| 357.6 | 0.026 |
| 357.7 | 0.028 |
| 357.8 | 0.026 |
| 357.9 | 0.027 |
| 358.0 | 0.026 |
| 358.1 | 0.026 |
| 358.2 | 0.024 |
| 358.3 | 0.026 |
| 358.4 | 0.023 |
| 358.5 | 0.028 |
| 358.6 | 0.032 |
| 358.7 | 0.033 |
| 358.8 | 0.02 |
| 358.9 | 0.024 |
| 359.0 | 0.022 |
| 359.1 | 0.02 |
| 359.2 | 0.023 |
| 359.3 | 0.024 |
| 359.4 | 0.023 |
| 359.5 | 0.024 |
| 359.6 | 0.024 |
| 359.7 | 0.022 |
| 359.8 | 0.021 |
| 359.9 | 0.021 |
| 360.0 | 0.02 |
| 360.1 | 0.02 |
| 360.2 | 0.02 |
| 360.3 | 0.023 |
| 360.4 | 0.026 |
| 360.5 | 0.023 |
| 360.6 | 0.021 |
| 360.7 | 0.023 |
| 360.8 | 0.022 |
| 360.9 | 0.023 |
| 361.0 | 0.02 |
| 361.1 | 0.021 |
| 361.2 | 0.023 |
| 361.3 | 0.018 |
| 361.4 | 0.024 |
| 361.5 | 0.02 |
| 361.6 | 0.022 |
| 361.7 | 0.019 |
| 361.8 | 0.02 |
| 361.9 | 0.02 |
| 362.0 | 0.021 |
| 362.1 | 0.023 |
| 362.2 | 0.018 |
| 362.3 | 0.022 |
| 362.4 | 0.021 |
| 362.5 | 0.008 |
| 362.6 | 0.013 |
| 362.7 | 0.027 |
| 362.8 | 0.012 |
| 362.9 | 0.017 |
| 363.0 | 0.019 |
| 363.1 | 0.016 |
| 363.2 | 0.015 |
| 363.3 | 0.017 |
| 363.4 | 0.022 |
| 363.5 | 0.016 |
| 363.6 | 0.02 |
| 363.7 | 0.015 |
| 363.8 | 0.013 |
| 363.9 | 0.018 |
| 364.0 | 0.014 |
| 364.1 | 0.014 |
| 364.2 | 0.021 |
| 364.3 | 0.019 |
| 364.4 | 0.02 |
| 364.5 | 0.016 |
| 364.6 | 0.016 |
| 364.7 | 0.016 |
| 364.8 | 0.016 |
| 364.9 | 0.016 |
| 365.0 | 0.016 |
| 365.1 | 0.015 |
| 365.2 | 0.012 |
| 365.3 | 0.017 |
| 365.4 | 0.017 |
| 365.5 | 0.013 |
| 365.6 | 0.015 |
| 365.7 | 0.018 |
| 365.8 | 0.017 |
| 365.9 | 0.016 |
| 366.0 | 0.009 |
| 366.1 | 0.016 |
| 366.2 | 0.021 |
| 366.3 | 0.026 |
| 366.4 | 0.016 |
| 366.5 | 0.01 |
| 366.6 | 0.012 |
| 366.7 | 0.015 |
| 366.8 | 0.015 |
| 366.9 | 0.013 |
| 367.0 | 0.015 |
| 367.1 | 0.015 |
| 367.2 | 0.013 |
| 367.3 | 0.015 |
| 367.4 | 0.011 |
| 367.5 | 0.014 |
| 367.6 | 0.013 |
| 367.7 | 0.012 |
| 367.8 | 0.013 |
| 367.9 | 0.015 |
| 368.0 | 0.015 |
| 368.1 | 0.013 |
| 368.2 | 0.014 |
| 368.3 | 0.014 |
| 368.4 | 0.012 |
| 368.5 | 0.013 |
| 368.6 | 0.014 |
| 368.7 | 0.013 |
| 368.8 | 0.012 |
| 368.9 | 0.016 |
| 369.0 | 0.015 |
| 369.1 | 0.012 |
| 369.2 | 0.015 |
| 369.3 | 0.016 |
| 369.4 | 0.014 |
| 369.5 | 0.007 |
| 369.6 | 0.023 |
| 369.7 | 0.007 |
| 369.8 | 0.004 |
| 369.9 | 0.008 |
| 370.0 | 0.013 |
| 370.1 | 0.011 |
| 370.2 | 0.011 |
| 370.3 | 0.009 |
| 370.4 | 0.014 |
| 370.5 | 0.009 |
| 370.6 | 0.011 |
| 370.7 | 0.009 |
| 370.8 | 0.007 |
| 370.9 | 0.017 |
| 371.0 | 0.009 |
| 371.1 | 0.015 |
| 371.2 | 0.013 |
| 371.3 | 0.013 |
| 371.4 | 0.014 |
| 371.5 | 0.005 |
| 371.6 | 0.011 |
| 371.7 | 0.01 |
| 371.8 | 0.012 |
| 371.9 | 0.008 |
| 372.0 | 0.01 |
| 372.1 | 0.008 |
| 372.2 | 0.012 |
| 372.3 | 0.009 |
| 372.4 | 0.01 |
| 372.5 | 0.013 |
| 372.6 | 0.009 |
| 372.7 | 0.012 |
| 372.8 | 0.009 |
| 372.9 | 0.013 |
| 373.0 | 0.007 |
| 373.1 | 0.013 |
| 373.2 | 0.004 |
| 373.3 | 0.019 |
| 373.4 | 0.015 |
| 373.5 | 0.015 |
| 373.6 | 0.009 |
| 373.7 | 0.012 |
| 373.8 | 0.013 |
| 373.9 | 0.01 |
| 374.0 | 0.012 |
| 374.1 | 0.011 |
| 374.2 | 0.01 |
| 374.3 | 0.012 |
| 374.4 | 0.007 |
| 374.5 | 0.013 |
| 374.6 | 0.008 |
| 374.7 | 0.005 |
| 374.8 | 0.01 |
| 374.9 | 0.013 |
| 375.0 | 0.01 |
| 375.1 | 0.009 |
| 375.2 | 0.01 |
| 375.3 | 0.011 |
| 375.4 | 0.011 |
| 375.5 | 0.008 |
| 375.6 | 0.012 |
| 375.7 | 0.01 |
| 375.8 | 0.01 |
| 375.9 | 0.01 |
| 376.0 | 0.008 |
| 376.1 | 0.008 |
| 376.2 | 0.012 |
| 376.3 | 0.01 |
| 376.4 | 0.01 |
| 376.5 | 0.007 |
| 376.6 | 0.009 |
| 376.7 | 0.01 |
| 376.8 | 0.008 |
| 376.9 | 0.009 |
| 377.0 | 0.01 |
| 377.1 | 0.005 |
| 377.2 | 0.003 |
| 377.3 | 0.013 |
| 377.4 | 0.016 |
| 377.5 | 0.007 |
| 377.6 | 0.015 |
| 377.7 | 0.007 |
| 377.8 | 0.013 |
| 377.9 | 0.012 |
| 378.0 | 0.006 |
| 378.1 | 0.01 |
| 378.2 | 0.008 |
| 378.3 | 0.009 |
| 378.4 | 0.009 |
| 378.5 | 0.016 |
| 378.6 | 0.012 |
| 378.7 | 0.009 |
| 378.8 | 0.012 |
| 378.9 | 0.009 |
| 379.0 | 0.011 |
| 379.1 | 0.008 |
| 379.2 | 0.006 |
| 379.3 | 0.011 |
| 379.4 | 0.005 |
| 379.5 | 0.011 |
| 379.6 | 0.01 |
| 379.7 | 0.007 |
| 379.8 | 0.009 |
| 379.9 | 0.009 |
| 380.0 | 0.01 |
| 380.1 | 0.01 |
| 380.2 | 0.01 |
| 380.3 | 0.01 |
| 380.4 | 0.009 |
| 380.5 | 0.01 |
| 380.6 | 0.01 |
| 380.7 | 0.009 |
| 380.8 | 0.007 |
| 380.9 | 0.007 |
| 381.0 | 0.007 |
| 381.1 | 0.01 |
| 381.2 | 0.005 |
| 381.3 | 0.017 |
| 381.4 | 0.001 |
| 381.5 | 0.009 |
| 381.6 | 0.005 |
| 381.7 | 0.003 |
| 381.8 | 0.004 |
| 381.9 | 0.007 |
| 382.0 | 0.007 |
| 382.1 | 0.01 |
| 382.2 | 0.012 |
| 382.3 | 0.008 |
| 382.4 | 0.009 |
| 382.5 | 0.008 |
| 382.6 | 0.007 |
| 382.7 | 0.007 |
| 382.8 | 0.004 |
| 382.9 | 0.007 |
| 383.0 | 0.006 |
| 383.1 | 0.012 |
| 383.2 | 0.01 |
| 383.3 | 0.009 |
| 383.4 | 0.008 |
| 383.5 | 0.008 |
| 383.6 | 0.009 |
| 383.7 | 0.009 |
| 383.8 | 0.009 |
| 383.9 | 0.009 |
| 384.0 | 0.008 |
| 384.1 | 0.008 |
| 384.2 | 0.007 |
| 384.3 | 0.005 |
| 384.4 | 0.011 |
| 384.5 | 0.009 |
| 384.6 | 0.009 |
| 384.7 | 0.008 |
| 384.8 | 0.007 |
| 384.9 | 0.009 |
| 385.0 | 0.009 |
| 385.1 | 0.009 |
| 385.2 | 0.009 |
| 385.3 | 0.009 |
| 385.4 | 0.007 |
| 385.5 | 0.007 |
| 385.6 | 0.008 |
| 385.7 | 0.009 |
| 385.8 | 0.002 |
| 385.9 | 0.005 |
| 386.0 | 0.012 |
| 386.1 | 0.006 |
| 386.2 | 0.012 |
| 386.3 | 0.004 |
| 386.4 | -0.003 |
| 386.5 | 0.02 |
| 386.6 | 0.01 |
| 386.7 | 0.004 |
| 386.8 | 0.004 |
| 386.9 | 0.007 |
| 387.0 | 0.008 |
| 387.1 | 0.007 |
| 387.2 | 0.009 |
| 387.3 | 0.01 |
| 387.4 | 0.005 |
| 387.5 | 0.008 |
| 387.6 | 0.005 |
| 387.7 | 0.01 |
| 387.8 | 0.009 |
| 387.9 | 0.008 |
| 388.0 | 0.012 |
| 388.1 | 0.005 |
| 388.2 | 0.005 |
| 388.3 | 0.012 |
| 388.4 | 0.002 |
| 388.5 | 0.01 |
| 388.6 | 0.007 |
| 388.7 | 0.003 |
| 388.8 | 0.008 |
| 388.9 | 0.003 |
| 389.0 | 0.004 |
| 389.1 | 0.005 |
| 389.2 | 0.01 |
| 389.3 | 0.011 |
| 389.4 | 0.01 |
| 389.5 | 0.009 |
| 389.6 | 0.006 |
| 389.7 | 0.01 |
| 389.8 | 0.007 |
| 389.9 | 0.007 |
| 390.0 | 0.01 |
| 390.1 | 0.008 |
| 390.2 | 0.005 |
| 390.3 | 0.007 |
| 390.4 | 0.005 |
| 390.5 | 0.007 |
| 390.6 | 0.008 |
| 390.7 | 0.007 |
| 390.8 | 0.009 |
| 390.9 | 0.007 |
| 391.0 | 0.004 |
| 391.1 | 0.008 |
| 391.2 | 0.005 |
| 391.3 | 0.008 |
| 391.4 | 0.007 |
| 391.5 | 0.006 |
| 391.6 | 0.009 |
| 391.7 | 0.009 |
| 391.8 | 0.009 |
| 391.9 | 0.017 |
| 392.0 | 0.008 |
| 392.1 | 0.008 |
| 392.2 | 0.015 |
| 392.3 | 0.009 |
| 392.4 | 0.001 |
| 392.5 | 0.009 |
| 392.6 | 0.006 |
| 392.7 | 0.009 |
| 392.8 | 0.007 |
| 392.9 | 0.004 |
| 393.0 | 0.008 |
| 393.1 | 0.008 |
| 393.2 | 0.006 |
| 393.3 | 0.009 |
| 393.4 | 0.01 |
| 393.5 | 0.009 |
| 393.6 | 0.01 |
| 393.7 | 0.004 |
| 393.8 | 0.006 |
| 393.9 | 0.005 |
| 394.0 | 0.004 |
| 394.1 | 0.012 |
| 394.2 | 0.006 |
| 394.3 | 0.011 |
| 394.4 | 0.008 |
| 394.5 | 0.004 |
| 394.6 | 0.003 |
| 394.7 | 0.01 |
| 394.8 | 0.01 |
| 394.9 | 0.009 |
| 395.0 | 0.005 |
| 395.1 | 0.009 |
| 395.2 | 0.007 |
| 395.3 | 0.007 |
| 395.4 | 0.007 |
| 395.5 | 0.01 |
| 395.6 | 0.009 |
| 395.7 | 0.008 |
| 395.8 | 0.006 |
| 395.9 | 0.006 |
| 396.0 | 0.005 |
| 396.1 | 0.009 |
| 396.2 | 0.01 |
| 396.3 | 0.01 |
| 396.4 | 0.006 |
| 396.5 | 0.01 |
| 396.6 | 0.01 |
| 396.7 | 0.004 |
| 396.8 | 0.01 |
| 396.9 | 0.006 |
| 397.0 | 0.005 |
| 397.1 | 0.007 |
| 397.2 | 0.011 |
| 397.3 | 0.009 |
| 397.4 | 0.005 |
| 397.5 | 0.007 |
| 397.6 | 0.008 |
| 397.7 | 0.009 |
| 397.8 | 0.011 |
| 397.9 | 0.002 |
| 398.0 | -0.002 |
| 398.1 | 0.005 |
| 398.2 | 0.012 |
| 398.3 | 0.002 |
| 398.4 | 0.011 |
| 398.5 | 0.015 |
| 398.6 | 0.01 |
| 398.7 | 0.005 |
| 398.8 | 0.004 |
| 398.9 | 0.008 |
| 399.0 | 0.008 |
| 399.1 | 0.007 |
| 399.2 | 0.005 |
| 399.3 | 0.005 |
| 399.4 | 0.005 |
| 399.5 | 0.004 |
| 399.6 | 0.01 |
| 399.7 | 0.009 |
| 399.8 | 0.006 |
| 399.9 | 0.007 |
| 400.0 | 0.002 |
| 400.1 | 0.005 |
| 400.2 | 0.009 |
| 400.3 | 0.011 |
| 400.4 | 0.01 |
| 400.5 | 0.007 |
| 400.6 | 0.007 |
| 400.7 | 0.009 |
| 400.8 | 0.005 |
| 400.9 | 0.012 |
| 401.0 | 0.009 |
| 401.1 | 0.011 |
| 401.2 | 0.008 |
| 401.3 | 0.007 |
| 401.4 | 0.01 |
| 401.5 | 0.009 |
| 401.6 | 0.01 |
| 401.7 | 0.004 |
| 401.8 | 0.009 |
| 401.9 | 0.007 |
| 402.0 | 0.007 |
| 402.1 | 0.008 |
| 402.2 | 0.005 |
| 402.3 | 0.005 |
| 402.4 | 0.009 |
| 402.5 | 0.003 |
| 402.6 | 0.007 |
| 402.7 | 0.007 |
| 402.8 | 0.009 |
| 402.9 | 0.007 |
| 403.0 | 0.004 |
| 403.1 | 0.007 |
| 403.2 | 0.01 |
| 403.3 | 0.009 |
| 403.4 | 0.002 |
| 403.5 | 0.015 |
| 403.6 | -0.001 |
| 403.7 | -0.001 |
| 403.8 | 0.005 |
| 403.9 | 0.006 |
| 404.0 | 0.004 |
| 404.1 | 0.009 |
| 404.2 | 0.009 |
| 404.3 | 0.01 |
| 404.4 | 0.014 |
| 404.5 | 0.01 |
| 404.6 | 0.014 |
| 404.7 | 0.01 |
| 404.8 | 0.012 |
| 404.9 | 0.013 |
| 405.0 | 0.014 |
| 405.1 | 0.013 |
| 405.2 | 0.018 |
| 405.3 | 0.018 |
| 405.4 | 0.015 |
| 405.5 | 0.016 |
| 405.6 | 0.023 |
| 405.7 | 0.02 |
| 405.8 | 0.021 |
| 405.9 | 0.022 |
| 406.0 | 0.023 |
| 406.1 | 0.024 |
| 406.2 | 0.025 |
| 406.3 | 0.027 |
| 406.4 | 0.026 |
| 406.5 | 0.032 |
| 406.6 | 0.031 |
| 406.7 | 0.032 |
| 406.8 | 0.031 |
| 406.9 | 0.034 |
| 407.0 | 0.034 |
| 407.1 | 0.035 |
| 407.2 | 0.036 |
| 407.3 | 0.039 |
| 407.4 | 0.04 |
| 407.5 | 0.042 |
| 407.6 | 0.042 |
| 407.7 | 0.04 |
| 407.8 | 0.043 |
| 407.9 | 0.044 |
| 408.0 | 0.041 |
| 408.1 | 0.043 |
| 408.2 | 0.048 |
| 408.3 | 0.05 |
| 408.4 | 0.049 |
| 408.5 | 0.051 |
| 408.6 | 0.053 |
| 408.7 | 0.051 |
| 408.8 | 0.054 |
| 408.9 | 0.045 |
| 409.0 | 0.046 |
| 409.1 | 0.059 |
| 409.2 | 0.05 |
| 409.3 | 0.063 |
| 409.4 | 0.061 |
| 409.5 | 0.058 |
| 409.6 | 0.056 |
| 409.7 | 0.061 |
| 409.8 | 0.062 |
| 409.9 | 0.061 |
| 410.0 | 0.063 |
| 410.1 | 0.062 |
| 410.2 | 0.067 |
| 410.3 | 0.061 |
| 410.4 | 0.068 |
| 410.5 | 0.065 |
| 410.6 | 0.06 |
| 410.7 | 0.066 |
| 410.8 | 0.071 |
| 410.9 | 0.068 |
| 411.0 | 0.069 |
| 411.1 | 0.068 |
| 411.2 | 0.068 |
| 411.3 | 0.074 |
| 411.4 | 0.069 |
| 411.5 | 0.073 |
| 411.6 | 0.074 |
| 411.7 | 0.072 |
| 411.8 | 0.073 |
| 411.9 | 0.078 |
| 412.0 | 0.076 |
| 412.1 | 0.075 |
| 412.2 | 0.078 |
| 412.3 | 0.079 |
| 412.4 | 0.075 |
| 412.5 | 0.076 |
| 412.6 | 0.078 |
| 412.7 | 0.079 |
| 412.8 | 0.078 |
| 412.9 | 0.08 |
| 413.0 | 0.081 |
| 413.1 | 0.079 |
| 413.2 | 0.077 |
| 413.3 | 0.079 |
| 413.4 | 0.082 |
| 413.5 | 0.077 |
| 413.6 | 0.082 |
| 413.7 | 0.086 |
| 413.8 | 0.077 |
| 413.9 | 0.091 |
| 414.0 | 0.075 |
| 414.1 | 0.085 |
| 414.2 | 0.078 |
| 414.3 | 0.078 |
| 414.4 | 0.085 |
| 414.5 | 0.082 |
| 414.6 | 0.085 |
| 414.7 | 0.083 |
| 414.8 | 0.084 |
| 414.9 | 0.085 |
| 415.0 | 0.086 |
| 415.1 | 0.088 |
| 415.2 | 0.087 |
| 415.3 | 0.088 |
| 415.4 | 0.084 |
| 415.5 | 0.086 |
| 415.6 | 0.084 |
| 415.7 | 0.085 |
| 415.8 | 0.089 |
| 415.9 | 0.087 |
| 416.0 | 0.085 |
| 416.1 | 0.085 |
| 416.2 | 0.085 |
| 416.3 | 0.087 |
| 416.4 | 0.087 |
| 416.5 | 0.085 |
| 416.6 | 0.088 |
| 416.7 | 0.083 |
| 416.8 | 0.088 |
| 416.9 | 0.086 |
| 417.0 | 0.087 |
| 417.1 | 0.086 |
| 417.2 | 0.087 |
| 417.3 | 0.089 |
| 417.4 | 0.089 |
| 417.5 | 0.085 |
| 417.6 | 0.088 |
| 417.7 | 0.089 |
| 417.8 | 0.09 |
| 417.9 | 0.084 |
| 418.0 | 0.086 |
| 418.1 | 0.089 |
| 418.2 | 0.085 |
| 418.3 | 0.087 |
| 418.4 | 0.089 |
| 418.5 | 0.079 |
| 418.6 | 0.082 |
| 418.7 | 0.084 |
| 418.8 | 0.083 |
| 418.9 | 0.084 |
| 419.0 | 0.093 |
| 419.1 | 0.086 |
| 419.2 | 0.085 |
| 419.3 | 0.089 |
| 419.4 | 0.085 |
| 419.5 | 0.091 |
| 419.6 | 0.094 |
| 419.7 | 0.093 |
| 419.8 | 0.091 |
| 419.9 | 0.09 |
| 420.0 | 0.09 |
| 420.1 | 0.094 |
| 420.2 | 0.089 |
| 420.3 | 0.09 |
| 420.4 | 0.088 |
| 420.5 | 0.087 |
| 420.6 | 0.089 |
| 420.7 | 0.09 |
| 420.8 | 0.093 |
| 420.9 | 0.093 |
| 421.0 | 0.089 |
| 421.1 | 0.089 |
| 421.2 | 0.094 |
| 421.3 | 0.092 |
| 421.4 | 0.09 |
| 421.5 | 0.089 |
| 421.6 | 0.091 |
| 421.7 | 0.088 |
| 421.8 | 0.09 |
| 421.9 | 0.09 |
| 422.0 | 0.092 |
| 422.1 | 0.089 |
| 422.2 | 0.089 |
| 422.3 | 0.087 |
| 422.4 | 0.088 |
| 422.5 | 0.087 |
| 422.6 | 0.092 |
| 422.7 | 0.091 |
| 422.8 | 0.085 |
| 422.9 | 0.09 |
| 423.0 | 0.089 |
| 423.1 | 0.088 |
| 423.2 | 0.092 |
| 423.3 | 0.093 |
| 423.4 | 0.095 |
| 423.5 | 0.092 |
| 423.6 | 0.087 |
| 423.7 | 0.088 |
| 423.8 | 0.079 |
| 423.9 | 0.093 |
| 424.0 | 0.097 |
| 424.1 | 0.089 |
| 424.2 | 0.092 |
| 424.3 | 0.086 |
| 424.4 | 0.091 |
| 424.5 | 0.09 |
| 424.6 | 0.091 |
| 424.7 | 0.089 |
| 424.8 | 0.09 |
| 424.9 | 0.087 |
| 425.0 | 0.092 |
| 425.1 | 0.088 |
| 425.2 | 0.091 |
| 425.3 | 0.094 |
| 425.4 | 0.092 |
| 425.5 | 0.093 |
| 425.6 | 0.088 |
| 425.7 | 0.094 |
| 425.8 | 0.092 |
| 425.9 | 0.089 |
| 426.0 | 0.09 |
| 426.1 | 0.088 |
| 426.2 | 0.092 |
| 426.3 | 0.091 |
| 426.4 | 0.092 |
| 426.5 | 0.087 |
| 426.6 | 0.089 |
| 426.7 | 0.092 |
| 426.8 | 0.09 |
| 426.9 | 0.092 |
| 427.0 | 0.092 |
| 427.1 | 0.09 |
| 427.2 | 0.088 |
| 427.3 | 0.09 |
| 427.4 | 0.088 |
| 427.5 | 0.091 |
| 427.6 | 0.09 |
| 427.7 | 0.093 |
| 427.8 | 0.091 |
| 427.9 | 0.093 |
| 428.0 | 0.087 |
| 428.1 | 0.092 |
| 428.2 | 0.091 |
| 428.3 | 0.092 |
| 428.4 | 0.091 |
| 428.5 | 0.085 |
| 428.6 | 0.093 |
| 428.7 | 0.091 |
| 428.8 | 0.101 |
| 428.9 | 0.087 |
| 429.0 | 0.089 |
| 429.1 | 0.093 |
| 429.2 | 0.088 |
| 429.3 | 0.091 |
| 429.4 | 0.088 |
| 429.5 | 0.09 |
| 429.6 | 0.088 |
| 429.7 | 0.089 |
| 429.8 | 0.09 |
| 429.9 | 0.085 |
| 430.0 | 0.09 |
| 430.1 | 0.093 |
| 430.2 | 0.086 |
| 430.3 | 0.094 |
| 430.4 | 0.089 |
| 430.5 | 0.085 |
| 430.6 | 0.097 |
| 430.7 | 0.09 |
| 430.8 | 0.087 |
| 430.9 | 0.092 |
| 431.0 | 0.086 |
| 431.1 | 0.095 |
| 431.2 | 0.09 |
| 431.3 | 0.089 |
| 431.4 | 0.091 |
| 431.5 | 0.089 |
| 431.6 | 0.09 |
| 431.7 | 0.089 |
| 431.8 | 0.09 |
| 431.9 | 0.089 |
| 432.0 | 0.09 |
| 432.1 | 0.089 |
| 432.2 | 0.091 |
| 432.3 | 0.091 |
| 432.4 | 0.087 |
| 432.5 | 0.089 |
| 432.6 | 0.087 |
| 432.7 | 0.089 |
| 432.8 | 0.093 |
| 432.9 | 0.092 |
| 433.0 | 0.084 |
| 433.1 | 0.09 |
| 433.2 | 0.093 |
| 433.3 | 0.089 |
| 433.4 | 0.093 |
| 433.5 | 0.096 |
| 433.6 | 0.09 |
| 433.7 | 0.091 |
| 433.8 | 0.09 |
| 433.9 | 0.087 |
| 434.0 | 0.082 |
| 434.1 | 0.09 |
| 434.2 | 0.091 |
| 434.3 | 0.089 |
| 434.4 | 0.089 |
| 434.5 | 0.089 |
| 434.6 | 0.086 |
| 434.7 | 0.087 |
| 434.8 | 0.09 |
| 434.9 | 0.085 |
| 435.0 | 0.089 |
| 435.1 | 0.09 |
| 435.2 | 0.087 |
| 435.3 | 0.086 |
| 435.4 | 0.09 |
| 435.5 | 0.085 |
| 435.6 | 0.086 |
| 435.7 | 0.09 |
| 435.8 | 0.085 |
| 435.9 | 0.087 |
| 436.0 | 0.088 |
| 436.1 | 0.089 |
| 436.2 | 0.086 |
| 436.3 | 0.09 |
| 436.4 | 0.088 |
| 436.5 | 0.087 |
| 436.6 | 0.091 |
| 436.7 | 0.089 |
| 436.8 | 0.09 |
| 436.9 | 0.09 |
| 437.0 | 0.086 |
| 437.1 | 0.087 |
| 437.2 | 0.09 |
| 437.3 | 0.084 |
| 437.4 | 0.09 |
| 437.5 | 0.087 |
| 437.6 | 0.087 |
| 437.7 | 0.088 |
| 437.8 | 0.087 |
| 437.9 | 0.087 |
| 438.0 | 0.097 |
| 438.1 | 0.092 |
| 438.2 | 0.094 |
| 438.3 | 0.085 |
| 438.4 | 0.087 |
| 438.5 | 0.087 |
| 438.6 | 0.084 |
| 438.7 | 0.089 |
| 438.8 | 0.086 |
| 438.9 | 0.092 |
| 439.0 | 0.089 |
| 439.1 | 0.087 |
| 439.2 | 0.09 |
| 439.3 | 0.086 |
| 439.4 | 0.09 |
| 439.5 | 0.088 |
| 439.6 | 0.085 |
| 439.7 | 0.095 |
| 439.8 | 0.084 |
| 439.9 | 0.087 |
| 440.0 | 0.09 |
| 440.1 | 0.084 |
| 440.2 | 0.088 |
| 440.3 | 0.087 |
| 440.4 | 0.091 |
| 440.5 | 0.086 |
| 440.6 | 0.088 |
| 440.7 | 0.087 |
| 440.8 | 0.087 |
| 440.9 | 0.087 |
| 441.0 | 0.085 |
| 441.1 | 0.09 |
| 441.2 | 0.088 |
| 441.3 | 0.088 |
| 441.4 | 0.09 |
| 441.5 | 0.089 |
| 441.6 | 0.087 |
| 441.7 | 0.087 |
| 441.8 | 0.089 |
| 441.9 | 0.088 |
| 442.0 | 0.087 |
| 442.1 | 0.086 |
| 442.2 | 0.082 |
| 442.3 | 0.079 |
| 442.4 | 0.081 |
| 442.5 | 0.082 |
| 442.6 | 0.093 |
| 442.7 | 0.092 |
| 442.8 | 0.084 |
| 442.9 | 0.087 |
| 443.0 | 0.089 |
| 443.1 | 0.089 |
| 443.2 | 0.089 |
| 443.3 | 0.089 |
| 443.4 | 0.092 |
| 443.5 | 0.088 |
| 443.6 | 0.084 |
| 443.7 | 0.086 |
| 443.8 | 0.09 |
| 443.9 | 0.092 |
| 444.0 | 0.085 |
| 444.1 | 0.084 |
| 444.2 | 0.087 |
| 444.3 | 0.088 |
| 444.4 | 0.088 |
| 444.5 | 0.088 |
| 444.6 | 0.087 |
| 444.7 | 0.086 |
| 444.8 | 0.085 |
| 444.9 | 0.085 |
| 445.0 | 0.087 |
| 445.1 | 0.087 |
| 445.2 | 0.088 |
| 445.3 | 0.087 |
| 445.4 | 0.087 |
| 445.5 | 0.089 |
| 445.6 | 0.087 |
| 445.7 | 0.09 |
| 445.8 | 0.084 |
| 445.9 | 0.089 |
| 446.0 | 0.087 |
| 446.1 | 0.084 |
| 446.2 | 0.089 |
| 446.3 | 0.081 |
| 446.4 | 0.088 |
| 446.5 | 0.089 |
| 446.6 | 0.089 |
| 446.7 | 0.087 |
| 446.8 | 0.082 |
| 446.9 | 0.087 |
| 447.0 | 0.086 |
| 447.1 | 0.085 |
| 447.2 | 0.088 |
| 447.3 | 0.09 |
| 447.4 | 0.085 |
| 447.5 | 0.084 |
| 447.6 | 0.086 |
| 447.7 | 0.087 |
| 447.8 | 0.085 |
| 447.9 | 0.081 |
| 448.0 | 0.094 |
| 448.1 | 0.09 |
| 448.2 | 0.089 |
| 448.3 | 0.088 |
| 448.4 | 0.087 |
| 448.5 | 0.084 |
| 448.6 | 0.087 |
| 448.7 | 0.084 |
| 448.8 | 0.087 |
| 448.9 | 0.087 |
| 449.0 | 0.084 |
| 449.1 | 0.087 |
| 449.2 | 0.088 |
| 449.3 | 0.083 |
| 449.4 | 0.085 |
| 449.5 | 0.087 |
| 449.6 | 0.082 |
| 449.7 | 0.087 |
| 449.8 | 0.087 |
| 449.9 | 0.094 |
| 450.0 | 0.088 |
| 450.1 | 0.086 |
| 450.2 | 0.082 |
| 450.3 | 0.087 |
| 450.4 | 0.084 |
| 450.5 | 0.085 |
| 450.6 | 0.084 |
| 450.7 | 0.089 |
| 450.8 | 0.084 |
| 450.9 | 0.086 |
| 451.0 | 0.081 |
| 451.1 | 0.085 |
| 451.2 | 0.087 |
| 451.3 | 0.084 |
| 451.4 | 0.089 |
| 451.5 | 0.086 |
| 451.6 | 0.083 |
| 451.7 | 0.087 |
| 451.8 | 0.085 |
| 451.9 | 0.086 |
| 452.0 | 0.085 |
| 452.1 | 0.088 |
| 452.2 | 0.085 |
| 452.3 | 0.085 |
| 452.4 | 0.083 |
| 452.5 | 0.089 |
| 452.6 | 0.086 |
| 452.7 | 0.085 |
| 452.8 | 0.087 |
| 452.9 | 0.084 |
| 453.0 | 0.089 |
| 453.1 | 0.088 |
| 453.2 | 0.087 |
| 453.3 | 0.084 |
| 453.4 | 0.078 |
| 453.5 | 0.085 |
| 453.6 | 0.076 |
| 453.7 | 0.09 |
| 453.8 | 0.088 |
| 453.9 | 0.087 |
| 454.0 | 0.088 |
| 454.1 | 0.086 |
| 454.2 | 0.092 |
| 454.3 | 0.085 |
| 454.4 | 0.087 |
| 454.5 | 0.088 |
| 454.6 | 0.084 |
| 454.7 | 0.093 |
| 454.8 | 0.09 |
| 454.9 | 0.093 |
| 455.0 | 0.09 |
| 455.1 | 0.089 |
| 455.2 | 0.089 |
| 455.3 | 0.09 |
| 455.4 | 0.09 |
| 455.5 | 0.085 |
| 455.6 | 0.088 |
| 455.7 | 0.085 |
| 455.8 | 0.089 |
| 455.9 | 0.082 |
| 456.0 | 0.084 |
| 456.1 | 0.089 |
| 456.2 | 0.084 |
| 456.3 | 0.087 |
| 456.4 | 0.087 |
| 456.5 | 0.083 |
| 456.6 | 0.079 |
| 456.7 | 0.085 |
| 456.8 | 0.087 |
| 456.9 | 0.085 |
| 457.0 | 0.085 |
| 457.1 | 0.094 |
| 457.2 | 0.093 |
| 457.3 | 0.079 |
| 457.4 | 0.079 |
| 457.5 | 0.089 |
| 457.6 | 0.083 |
| 457.7 | 0.084 |
| 457.8 | 0.088 |
| 457.9 | 0.085 |
| 458.0 | 0.085 |
| 458.1 | 0.089 |
| 458.2 | 0.088 |
| 458.3 | 0.087 |
| 458.4 | 0.086 |
| 458.5 | 0.084 |
| 458.6 | 0.088 |
| 458.7 | 0.087 |
| 458.8 | 0.088 |
| 458.9 | 0.089 |
| 459.0 | 0.087 |
| 459.1 | 0.086 |
| 459.2 | 0.085 |
| 459.3 | 0.086 |
| 459.4 | 0.087 |
| 459.5 | 0.085 |
| 459.6 | 0.089 |
| 459.7 | 0.085 |
| 459.8 | 0.084 |
| 459.9 | 0.084 |
| 460.0 | 0.082 |
| 460.1 | 0.085 |
| 460.2 | 0.084 |
| 460.3 | 0.087 |
| 460.4 | 0.083 |
| 460.5 | 0.082 |
| 460.6 | 0.085 |
| 460.7 | 0.084 |
| 460.8 | 0.084 |
| 460.9 | 0.084 |
| 461.0 | 0.084 |
| 461.1 | 0.085 |
| 461.2 | 0.085 |
| 461.3 | 0.09 |
| 461.4 | 0.079 |
| 461.5 | 0.082 |
| 461.6 | 0.092 |
| 461.7 | 0.082 |
| 461.8 | 0.083 |
| 461.9 | 0.084 |
| 462.0 | 0.084 |
| 462.1 | 0.085 |
| 462.2 | 0.085 |
| 462.3 | 0.085 |
| 462.4 | 0.082 |
| 462.5 | 0.081 |
| 462.6 | 0.081 |
| 462.7 | 0.083 |
| 462.8 | 0.089 |
| 462.9 | 0.087 |
| 463.0 | 0.085 |
| 463.1 | 0.093 |
| 463.2 | 0.084 |
| 463.3 | 0.091 |
| 463.4 | 0.082 |
| 463.5 | 0.088 |
| 463.6 | 0.087 |
| 463.7 | 0.082 |
| 463.8 | 0.083 |
| 463.9 | 0.086 |
| 464.0 | 0.085 |
| 464.1 | 0.09 |
| 464.2 | 0.088 |
| 464.3 | 0.086 |
| 464.4 | 0.086 |
| 464.5 | 0.083 |
| 464.6 | 0.085 |
| 464.7 | 0.085 |
| 464.8 | 0.084 |
| 464.9 | 0.089 |
| 465.0 | 0.085 |
| 465.1 | 0.084 |
| 465.2 | 0.082 |
| 465.3 | 0.087 |
| 465.4 | 0.085 |
| 465.5 | 0.087 |
| 465.6 | 0.087 |
| 465.7 | 0.087 |
| 465.8 | 0.081 |
| 465.9 | 0.085 |
| 466.0 | 0.087 |
| 466.1 | 0.084 |
| 466.2 | 0.089 |
| 466.3 | 0.075 |
| 466.4 | 0.076 |
| 466.5 | 0.083 |
| 466.6 | 0.078 |
| 466.7 | 0.081 |
| 466.8 | 0.087 |
| 466.9 | 0.089 |
| 467.0 | 0.082 |
| 467.1 | 0.084 |
| 467.2 | 0.082 |
| 467.3 | 0.085 |
| 467.4 | 0.085 |
| 467.5 | 0.084 |
| 467.6 | 0.088 |
| 467.7 | 0.084 |
| 467.8 | 0.087 |
| 467.9 | 0.082 |
| 468.0 | 0.085 |
| 468.1 | 0.088 |
| 468.2 | 0.084 |
| 468.3 | 0.087 |
| 468.4 | 0.087 |
| 468.5 | 0.082 |
| 468.6 | 0.085 |
| 468.7 | 0.082 |
| 468.8 | 0.084 |
| 468.9 | 0.083 |
| 469.0 | 0.084 |
| 469.1 | 0.086 |
| 469.2 | 0.082 |
| 469.3 | 0.085 |
| 469.4 | 0.082 |
| 469.5 | 0.083 |
| 469.6 | 0.082 |
| 469.7 | 0.082 |
| 469.8 | 0.082 |
| 469.9 | 0.085 |
| 470.0 | 0.085 |
| 470.1 | 0.085 |
| 470.2 | 0.086 |
| 470.3 | 0.085 |
| 470.4 | 0.084 |
| 470.5 | 0.084 |
| 470.6 | 0.084 |
| 470.7 | 0.088 |
| 470.8 | 0.085 |
| 470.9 | 0.087 |
| 471.0 | 0.086 |
| 471.1 | 0.084 |
| 471.2 | 0.081 |
| 471.3 | 0.081 |
| 471.4 | 0.086 |
| 471.5 | 0.092 |
| 471.6 | 0.078 |
| 471.7 | 0.09 |
| 471.8 | 0.082 |
| 471.9 | 0.088 |
| 472.0 | 0.085 |
| 472.1 | 0.077 |
| 472.2 | 0.088 |
| 472.3 | 0.084 |
| 472.4 | 0.089 |
| 472.5 | 0.084 |
| 472.6 | 0.085 |
| 472.7 | 0.085 |
| 472.8 | 0.082 |
| 472.9 | 0.076 |
| 473.0 | 0.078 |
| 473.1 | 0.078 |
| 473.2 | 0.085 |
| 473.3 | 0.084 |
| 473.4 | 0.078 |
| 473.5 | 0.073 |
| 473.6 | 0.068 |
| 473.7 | 0.073 |
| 473.8 | 0.071 |
| 473.9 | 0.068 |
| 474.0 | 0.074 |
| 474.1 | 0.066 |
| 474.2 | 0.073 |
| 474.3 | 0.071 |
| 474.4 | 0.06 |
| 474.5 | 0.071 |
| 474.6 | 0.063 |
| 474.7 | 0.065 |
| 474.8 | 0.063 |
| 474.9 | 0.062 |
| 475.0 | 0.064 |
| 475.1 | 0.059 |
| 475.2 | 0.059 |
| 475.3 | 0.059 |
| 475.4 | 0.06 |
| 475.5 | 0.059 |
| 475.6 | 0.057 |
| 475.7 | 0.056 |
| 475.8 | 0.053 |
| 475.9 | 0.053 |
| 476.0 | 0.052 |
| 476.1 | 0.052 |
| 476.2 | 0.052 |
| 476.3 | 0.054 |
| 476.4 | 0.052 |
| 476.5 | 0.054 |
| 476.6 | 0.053 |
| 476.7 | 0.05 |
| 476.8 | 0.048 |
| 476.9 | 0.047 |
| 477.0 | 0.058 |
| 477.1 | 0.039 |
| 477.2 | 0.058 |
| 477.3 | 0.052 |
| 477.4 | 0.04 |
| 477.5 | 0.054 |
| 477.6 | 0.05 |
| 477.7 | 0.044 |
| 477.8 | 0.047 |
| 477.9 | 0.046 |
| 478.0 | 0.046 |
| 478.1 | 0.042 |
| 478.2 | 0.045 |
| 478.3 | 0.041 |
| 478.4 | 0.037 |
| 478.5 | 0.042 |
| 478.6 | 0.038 |
| 478.7 | 0.045 |
| 478.8 | 0.042 |
| 478.9 | 0.037 |
| 479.0 | 0.036 |
| 479.1 | 0.04 |
| 479.2 | 0.035 |
| 479.3 | 0.039 |
| 479.4 | 0.041 |
| 479.5 | 0.037 |
| 479.6 | 0.034 |
| 479.7 | 0.036 |
| 479.8 | 0.038 |
| 479.9 | 0.036 |
| 480.0 | 0.034 |
| 480.1 | 0.035 |
| 480.2 | 0.035 |
| 480.3 | 0.035 |
| 480.4 | 0.032 |
| 480.5 | 0.035 |
| 480.6 | 0.032 |
| 480.7 | 0.032 |
| 480.8 | 0.034 |
| 480.9 | 0.031 |
| 481.0 | 0.034 |
| 481.1 | 0.031 |
| 481.2 | 0.031 |
| 481.3 | 0.034 |
| 481.4 | 0.031 |
| 481.5 | 0.032 |
| 481.6 | 0.029 |
| 481.7 | 0.031 |
| 481.8 | 0.025 |
| 481.9 | 0.03 |
| 482.0 | 0.026 |
| 482.1 | 0.026 |
| 482.2 | 0.026 |
| 482.3 | 0.021 |
| 482.4 | 0.037 |
| 482.5 | 0.026 |
| 482.6 | 0.027 |
| 482.7 | 0.033 |
| 482.8 | 0.028 |
| 482.9 | 0.031 |
| 483.0 | 0.027 |
| 483.1 | 0.027 |
| 483.2 | 0.02 |
| 483.3 | 0.024 |
| 483.4 | 0.023 |
| 483.5 | 0.025 |
| 483.6 | 0.023 |
| 483.7 | 0.022 |
| 483.8 | 0.032 |
| 483.9 | 0.025 |
| 484.0 | 0.028 |
| 484.1 | 0.02 |
| 484.2 | 0.027 |
| 484.3 | 0.02 |
| 484.4 | 0.027 |
| 484.5 | 0.023 |
| 484.6 | 0.018 |
| 484.7 | 0.023 |
| 484.8 | 0.023 |
| 484.9 | 0.023 |
| 485.0 | 0.022 |
| 485.1 | 0.02 |
| 485.2 | 0.024 |
| 485.3 | 0.022 |
| 485.4 | 0.02 |
| 485.5 | 0.021 |
| 485.6 | 0.022 |
| 485.7 | 0.021 |
| 485.8 | 0.021 |
| 485.9 | 0.023 |
| 486.0 | 0.023 |
| 486.1 | 0.021 |
| 486.2 | 0.018 |
| 486.3 | 0.021 |
| 486.4 | 0.019 |
| 486.5 | 0.023 |
| 486.6 | 0.021 |
| 486.7 | 0.014 |
| 486.8 | 0.012 |
| 486.9 | 0.025 |
| 487.0 | 0.016 |
| 487.1 | 0.023 |
| 487.2 | 0.014 |
| 487.3 | 0.021 |
| 487.4 | 0.021 |
| 487.5 | 0.017 |
| 487.6 | 0.015 |
| 487.7 | 0.02 |
| 487.8 | 0.015 |
| 487.9 | 0.018 |
| 488.0 | 0.02 |
| 488.1 | 0.018 |
| 488.2 | 0.016 |
| 488.3 | 0.015 |
| 488.4 | 0.02 |
| 488.5 | 0.013 |
| 488.6 | 0.015 |
| 488.7 | 0.019 |
| 488.8 | 0.018 |
| 488.9 | 0.015 |
| 489.0 | 0.018 |
| 489.1 | 0.016 |
| 489.2 | 0.02 |
| 489.3 | 0.016 |
| 489.4 | 0.013 |
| 489.5 | 0.015 |
| 489.6 | 0.017 |
| 489.7 | 0.013 |
| 489.8 | 0.013 |
| 489.9 | 0.017 |
| 490.0 | 0.013 |
| 490.1 | 0.016 |
| 490.2 | 0.017 |
| 490.3 | 0.018 |
| 490.4 | 0.015 |
| 490.5 | 0.016 |
| 490.6 | 0.013 |
| 490.7 | 0.012 |
| 490.8 | 0.014 |
| 490.9 | 0.01 |
| 491.0 | 0.015 |
| 491.1 | 0.008 |
| 491.2 | 0.007 |
| 491.3 | 0.015 |
| 491.4 | 0.012 |
| 491.5 | 0.012 |
| 491.6 | 0.017 |
| 491.7 | 0.015 |
| 491.8 | 0.015 |
| 491.9 | 0.013 |
| 492.0 | 0.011 |
| 492.1 | 0.009 |
| 492.2 | 0.01 |
| 492.3 | 0.01 |
| 492.4 | 0.014 |
| 492.5 | 0.015 |
| 492.6 | 0.009 |
| 492.7 | 0.013 |
| 492.8 | 0.015 |
| 492.9 | 0.007 |
| 493.0 | 0.016 |
| 493.1 | 0.01 |
| 493.2 | 0.013 |
| 493.3 | 0.013 |
| 493.4 | 0.015 |
| 493.5 | 0.015 |
| 493.6 | 0.013 |
| 493.7 | 0.012 |
| 493.8 | 0.013 |
| 493.9 | 0.012 |
| 494.0 | 0.014 |
| 494.1 | 0.012 |
| 494.2 | 0.009 |
| 494.3 | 0.01 |
| 494.4 | 0.012 |
| 494.5 | 0.009 |
| 494.6 | 0.01 |
| 494.7 | 0.011 |
| 494.8 | 0.011 |
| 494.9 | 0.011 |
| 495.0 | 0.013 |
| 495.1 | 0.012 |
| 495.2 | 0.015 |
| 495.3 | 0.009 |
| 495.4 | 0.022 |
| 495.5 | 0.016 |
| 495.6 | 0.015 |
| 495.7 | 0.004 |
| 495.8 | 0.018 |
| 495.9 | 0.013 |
| 496.0 | 0.014 |
| 496.1 | 0.011 |
| 496.2 | 0.009 |
| 496.3 | 0.009 |
| 496.4 | 0.009 |
| 496.5 | 0.01 |
| 496.6 | 0.009 |
| 496.7 | 0.009 |
| 496.8 | 0.01 |
| 496.9 | 0.01 |
| 497.0 | 0.009 |
| 497.1 | 0.007 |
| 497.2 | 0.009 |
| 497.3 | 0.01 |
| 497.4 | 0.01 |
| 497.5 | 0.009 |
| 497.6 | 0.009 |
| 497.7 | 0.007 |
| 497.8 | 0.01 |
| 497.9 | 0.011 |
| 498.0 | 0.008 |
| 498.1 | 0.011 |
| 498.2 | 0.01 |
| 498.3 | 0.009 |
| 498.4 | 0.008 |
| 498.5 | 0.012 |
| 498.6 | 0.006 |
| 498.7 | 0.011 |
| 498.8 | 0.011 |
| 498.9 | 0.01 |
| 499.0 | 0.01 |
| 499.1 | 0.007 |
| 499.2 | 0.003 |
| 499.3 | 0.013 |
| 499.4 | 0.007 |
| 499.5 | 0.002 |
| 499.6 | 0.004 |
| 499.7 | 0.012 |
| 499.8 | 0.002 |
| 499.9 | 0.013 |
| 500.0 | 0.012 |
| 500.1 | 0.007 |
| 500.2 | 0.008 |
| 500.3 | 0.007 |
| 500.4 | 0.008 |
| 500.5 | 0.005 |
| 500.6 | 0.007 |
| 500.7 | 0.015 |
| 500.8 | 0.012 |
| 500.9 | 0.013 |
| 501.0 | 0.009 |
| 501.1 | 0.005 |
| 501.2 | 0.013 |
| 501.3 | 0.009 |
| 501.4 | 0.005 |
| 501.5 | 0.004 |
| 501.6 | 0.006 |
| 501.7 | 0.01 |
| 501.8 | 0.005 |
| 501.9 | 0.007 |
| 502.0 | 0.007 |
| 502.1 | 0.008 |
| 502.2 | 0.007 |
| 502.3 | 0.007 |
| 502.4 | 0.007 |
| 502.5 | 0.007 |
| 502.6 | 0.006 |
| 502.7 | 0.007 |
| 502.8 | 0.006 |
| 502.9 | 0.006 |
| 503.0 | 0.006 |
| 503.1 | 0.006 |
| 503.2 | 0.004 |
| 503.3 | 0.008 |
| 503.4 | 0.01 |
| 503.5 | 0.007 |
| 503.6 | 0.013 |
| 503.7 | 0.016 |
| 503.8 | 0.004 |
| 503.9 | 0.014 |
| 504.0 | 0.009 |
| 504.1 | 0.007 |
| 504.2 | 0.006 |
| 504.3 | 0.009 |
| 504.4 | 0.008 |
| 504.5 | 0.006 |
| 504.6 | 0.005 |
| 504.7 | 0.009 |
| 504.8 | 0.005 |
| 504.9 | 0.009 |
| 505.0 | 0.006 |
| 505.1 | 0.009 |
| 505.2 | 0.004 |
| 505.3 | 0.008 |
| 505.4 | 0.004 |
| 505.5 | 0.005 |
| 505.6 | 0.011 |
| 505.7 | 0.007 |
| 505.8 | 0.005 |
| 505.9 | 0.007 |
| 506.0 | 0.007 |
| 506.1 | 0.005 |
| 506.2 | 0.007 |
| 506.3 | 0.009 |
| 506.4 | 0.006 |
| 506.5 | 0.004 |
| 506.6 | 0.005 |
| 506.7 | 0.004 |
| 506.8 | 0.007 |
| 506.9 | 0.009 |
| 507.0 | 0.009 |
| 507.1 | 0.004 |
| 507.2 | 0.005 |
| 507.3 | 0.004 |
| 507.4 | 0.009 |
| 507.5 | 0.006 |
| 507.6 | 0.004 |
| 507.7 | 0.007 |
| 507.8 | 0.004 |
| 507.9 | -0.003 |
| 508.0 | 0.004 |
| 508.1 | 0.012 |
| 508.2 | 0.007 |
| 508.3 | 0.007 |
| 508.4 | 0.006 |
| 508.5 | 0.008 |
| 508.6 | 0.009 |
| 508.7 | 0.005 |
| 508.8 | 0.005 |
| 508.9 | 0.003 |
| 509.0 | 0.006 |
| 509.1 | 0.005 |
| 509.2 | 0.007 |
| 509.3 | 0.004 |
| 509.4 | 0.003 |
| 509.5 | 0.012 |
| 509.6 | 0.003 |
| 509.7 | 0.005 |
| 509.8 | 0.003 |
| 509.9 | 0.007 |
| 510.0 | 0.005 |
| 510.1 | 0.01 |
| 510.2 | 0.012 |
| 510.3 | 0.005 |
| 510.4 | 0.004 |
| 510.5 | 0.01 |
| 510.6 | 0.007 |
| 510.7 | 0.003 |
| 510.8 | 0.005 |
| 510.9 | 0.007 |
| 511.0 | 0.006 |
| 511.1 | 0.005 |
| 511.2 | 0.005 |
| 511.3 | 0.007 |
| 511.4 | 0.005 |
| 511.5 | 0.005 |
| 511.6 | 0.008 |
| 511.7 | 0.01 |
| 511.8 | 0.006 |
| 511.9 | 0.007 |
| 512.0 | 0.007 |
| 512.1 | 0.005 |
| 512.2 | 0.009 |
| 512.3 | 0.007 |
| 512.4 | 0.009 |
| 512.5 | -0.001 |
| 512.6 | 0.008 |
| 512.7 | 0.014 |
| 512.8 | 0.001 |
| 512.9 | 0.013 |
| 513.0 | 0.009 |
| 513.1 | 0.007 |
| 513.2 | 0.005 |
| 513.3 | 0.009 |
| 513.4 | 0.004 |
| 513.5 | 0.004 |
| 513.6 | 0.005 |
| 513.7 | 0.008 |
| 513.8 | 0.005 |
| 513.9 | 0.005 |
| 514.0 | 0.008 |
| 514.1 | 0.003 |
| 514.2 | 0.003 |
| 514.3 | 0.003 |
| 514.4 | 0.009 |
| 514.5 | 0.007 |
| 514.6 | 0.009 |
| 514.7 | 0.007 |
| 514.8 | 0.003 |
| 514.9 | 0.008 |
| 515.0 | 0.007 |
| 515.1 | 0.006 |
| 515.2 | 0.006 |
| 515.3 | 0.007 |
| 515.4 | 0.007 |
| 515.5 | 0.005 |
| 515.6 | 0.004 |
| 515.7 | 0.007 |
| 515.8 | 0.003 |
| 515.9 | 0.005 |
| 516.0 | 0.007 |
| 516.1 | 0.004 |
| 516.2 | 0.004 |
| 516.3 | 0.004 |
| 516.4 | 0.005 |
| 516.5 | 0.002 |
| 516.6 | 0.006 |
| 516.7 | 0.009 |
| 516.8 | 0.005 |
| 516.9 | 0.004 |
| 517.0 | 0.001 |
| 517.1 | 0.002 |
| 517.2 | 0.009 |
| 517.3 | 0.011 |
| 517.4 | -0.004 |
| 517.5 | 0.001 |
| 517.6 | 0.013 |
| 517.7 | 0.012 |
| 517.8 | 0.011 |
| 517.9 | 0.01 |
| 518.0 | 0.002 |
| 518.1 | 0.005 |
| 518.2 | 0.005 |
| 518.3 | 0.004 |
| 518.4 | 0.004 |
| 518.5 | 0.004 |
| 518.6 | 0.009 |
| 518.7 | 0.006 |
| 518.8 | 0.004 |
| 518.9 | 0.009 |
| 519.0 | 0.005 |
| 519.1 | 0.002 |
| 519.2 | 0.005 |
| 519.3 | 0.005 |
| 519.4 | 0.002 |
| 519.5 | 0.007 |
| 519.6 | 0.001 |
| 519.7 | 0.007 |
| 519.8 | 0.003 |
| 519.9 | 0.01 |
| 520.0 | 0 |
| 520.1 | 0.005 |
| 520.2 | 0.004 |
| 520.3 | 0.005 |
| 520.4 | 0.005 |
| 520.5 | 0.006 |
| 520.6 | 0.006 |
| 520.7 | 0.007 |
| 520.8 | 0.004 |
| 520.9 | 0.005 |
| 521.0 | 0.007 |
| 521.1 | 0.004 |
| 521.2 | 0.008 |
| 521.3 | 0.006 |
| 521.4 | 0.006 |
| 521.5 | 0.005 |
| 521.6 | 0.002 |
| 521.7 | 0.004 |
| 521.8 | 0.003 |
| 521.9 | 0.008 |
| 522.0 | 0.002 |
| 522.1 | -0.004 |
| 522.2 | 0.001 |
| 522.3 | 0.018 |
| 522.4 | 0.012 |
| 522.5 | 0.007 |
| 522.6 | 0.008 |
| 522.7 | 0.005 |
| 522.8 | 0.002 |
| 522.9 | 0.006 |
| 523.0 | 0.003 |
| 523.1 | 0.005 |
| 523.2 | 0.003 |
| 523.3 | 0.004 |
| 523.4 | 0.003 |
| 523.5 | 0.003 |
| 523.6 | 0.007 |
| 523.7 | 0.007 |
| 523.8 | 0.007 |
| 523.9 | 0.009 |
| 524.0 | 0.007 |
| 524.1 | 0.009 |
| 524.2 | 0.003 |
| 524.3 | 0.004 |
| 524.4 | 0.004 |
| 524.5 | 0.006 |
| 524.6 | 0.006 |
| 524.7 | 0.004 |
| 524.8 | 0.007 |
| 524.9 | 0.004 |
| 525.0 | 0.006 |
| 525.1 | 0.004 |
| 525.2 | 0.004 |
| 525.3 | 0.004 |
| 525.4 | 0.007 |
| 525.5 | 0.007 |
| 525.6 | 0.008 |
| 525.7 | 0.004 |
| 525.8 | 0.004 |
| 525.9 | 0.007 |
| 526.0 | 0.006 |
| 526.1 | 0.007 |
| 526.2 | 0.005 |
| 526.3 | 0.005 |
| 526.4 | 0.002 |
| 526.5 | 0.001 |
| 526.6 | -0.004 |
| 526.7 | 0.003 |
| 526.8 | 0.013 |
| 526.9 | 0.014 |
| 527.0 | 0.005 |
| 527.1 | 0.001 |
| 527.2 | 0.006 |
| 527.3 | 0.005 |
| 527.4 | 0.002 |
| 527.5 | 0.006 |
| 527.6 | 0.002 |
| 527.7 | 0 |
| 527.8 | 0.007 |
| 527.9 | 0.004 |
| 528.0 | 0.005 |
| 528.1 | 0.004 |
| 528.2 | 0.002 |
| 528.3 | -0.002 |
| 528.4 | 0.001 |
| 528.5 | 0.01 |
| 528.6 | 0.01 |
| 528.7 | 0.005 |
| 528.8 | 0.001 |
| 528.9 | 0.011 |
| 529.0 | 0.01 |
| 529.1 | 0.006 |
| 529.2 | 0.003 |
| 529.3 | 0.004 |
| 529.4 | 0.007 |
| 529.5 | 0.004 |
| 529.6 | 0.004 |
| 529.7 | 0.007 |
| 529.8 | 0.004 |
| 529.9 | 0.007 |
| 530.0 | 0.005 |
| 530.1 | 0.002 |
| 530.2 | 0.005 |
| 530.3 | 0.003 |
| 530.4 | 0.007 |
| 530.5 | 0.004 |
| 530.6 | 0.007 |
| 530.7 | 0.009 |
| 530.8 | 0.004 |
| 530.9 | 0.001 |
| 531.0 | 0.004 |
| 531.1 | 0.007 |
| 531.2 | 0.012 |
| 531.3 | 0.003 |
| 531.4 | 0.009 |
| 531.5 | 0.007 |
| 531.6 | 0.004 |
| 531.7 | 0.005 |
| 531.8 | 0.004 |
| 531.9 | 0.006 |
| 532.0 | 0.009 |
| 532.1 | 0.009 |
| 532.2 | 0.005 |
| 532.3 | 0.004 |
| 532.4 | 0.009 |
| 532.5 | 0.007 |
| 532.6 | 0.003 |
| 532.7 | 0.009 |
| 532.8 | 0.003 |
| 532.9 | 0.007 |
| 533.0 | 0.003 |
| 533.1 | 0.003 |
| 533.2 | 0.005 |
| 533.3 | 0.004 |
| 533.4 | 0.007 |
| 533.5 | 0.002 |
| 533.6 | 0.002 |
| 533.7 | 0.005 |
| 533.8 | 0.004 |
| 533.9 | 0.005 |
| 534.0 | 0.002 |
| 534.1 | 0.002 |
| 534.2 | 0.004 |
| 534.3 | 0.004 |
| 534.4 | 0.007 |
| 534.5 | 0.003 |
| 534.6 | 0.001 |
| 534.7 | 0.004 |
| 534.8 | 0.002 |
| 534.9 | 0.007 |
| 535.0 | -0.002 |
| 535.1 | -0.001 |
| 535.2 | -0.002 |
| 535.3 | 0.002 |
| 535.4 | 0.008 |
| 535.5 | 0.005 |
| 535.6 | 0.007 |
| 535.7 | 0.008 |
| 535.8 | 0.01 |
| 535.9 | 0.002 |
| 536.0 | 0.002 |
| 536.1 | 0.007 |
| 536.2 | 0.008 |
| 536.3 | 0.007 |
| 536.4 | 0.005 |
| 536.5 | 0.005 |
| 536.6 | 0.007 |
| 536.7 | 0.005 |
| 536.8 | 0.004 |
| 536.9 | 0.005 |
| 537.0 | 0.007 |
| 537.1 | 0.004 |
| 537.2 | 0.007 |
| 537.3 | 0.004 |
| 537.4 | 0.007 |
| 537.5 | 0.005 |
| 537.6 | 0.005 |
| 537.7 | 0.005 |
| 537.8 | 0.006 |
| 537.9 | 0.007 |
| 538.0 | 0.004 |
| 538.1 | 0.005 |
| 538.2 | 0.007 |
| 538.3 | 0.001 |
| 538.4 | 0.001 |
| 538.5 | 0.009 |
| 538.6 | 0.003 |
| 538.7 | 0.006 |
| 538.8 | -0.001 |
| 538.9 | 0.01 |
| 539.0 | 0.014 |
| 539.1 | 0.002 |
| 539.2 | 0.001 |
| 539.3 | 0.004 |
| 539.4 | 0.005 |
| 539.5 | 0.005 |
| 539.6 | 0.004 |
| 539.7 | 0.005 |
| 539.8 | 0.006 |
| 539.9 | 0.009 |
| 540.0 | 0 |
| 540.1 | -0.001 |
| 540.2 | 0.006 |
| 540.3 | 0.004 |
| 540.4 | 0.007 |
| 540.5 | 0.008 |
| 540.6 | 0.007 |
| 540.7 | 0.006 |
| 540.8 | 0.003 |
| 540.9 | 0.005 |
| 541.0 | 0.009 |
| 541.1 | 0.006 |
| 541.2 | 0.006 |
| 541.3 | 0.003 |
| 541.4 | 0.005 |
| 541.5 | 0.009 |
| 541.6 | 0.007 |
| 541.7 | 0.007 |
| 541.8 | 0.006 |
| 541.9 | 0.004 |
| 542.0 | 0.005 |
| 542.1 | 0.002 |
| 542.2 | 0.002 |
| 542.3 | 0.008 |
| 542.4 | 0.003 |
| 542.5 | 0.005 |
| 542.6 | 0.005 |
| 542.7 | 0.004 |
| 542.8 | -0.005 |
| 542.9 | 0.01 |
| 543.0 | 0.004 |
| 543.1 | 0.002 |
| 543.2 | 0.009 |
| 543.3 | 0.005 |
| 543.4 | 0.004 |
| 543.5 | 0.007 |
| 543.6 | 0.003 |
| 543.7 | 0.007 |
| 543.8 | 0.001 |
| 543.9 | 0.007 |
| 544.0 | 0.006 |
| 544.1 | 0.01 |
| 544.2 | 0.002 |
| 544.3 | 0.012 |
| 544.4 | 0.001 |
| 544.5 | 0.002 |
| 544.6 | 0.004 |
| 544.7 | 0.004 |
| 544.8 | 0.002 |
| 544.9 | 0.008 |
| 545.0 | 0.007 |
| 545.1 | 0.004 |
| 545.2 | 0.005 |
| 545.3 | 0.004 |
| 545.4 | 0.007 |
| 545.5 | 0.006 |
| 545.6 | 0.005 |
| 545.7 | 0.004 |
| 545.8 | 0.006 |
| 545.9 | 0.005 |
| 546.0 | 0.006 |
| 546.1 | 0.004 |
| 546.2 | 0.001 |
| 546.3 | 0.002 |
| 546.4 | 0.004 |
| 546.5 | 0.006 |
| 546.6 | 0.004 |
| 546.7 | 0.003 |
| 546.8 | -0.003 |
| 546.9 | 0.002 |
| 547.0 | 0.007 |
| 547.1 | 0.009 |
| 547.2 | 0.007 |
| 547.3 | 0.004 |
| 547.4 | 0.005 |
| 547.5 | 0.007 |
| 547.6 | 0.005 |
| 547.7 | 0.009 |
| 547.8 | 0.002 |
| 547.9 | 0.004 |
| 548.0 | 0.005 |
| 548.1 | 0.002 |
| 548.2 | 0.007 |
| 548.3 | 0.001 |
| 548.4 | 0.004 |
| 548.5 | 0.009 |
| 548.6 | 0.005 |
| 548.7 | 0.009 |
| 548.8 | 0.006 |
| 548.9 | 0.005 |
| 549.0 | 0.006 |
| 549.1 | 0.005 |
| 549.2 | 0.004 |
| 549.3 | 0.008 |
| 549.4 | 0.004 |
| 549.5 | 0.007 |
| 549.6 | 0.004 |
| 549.7 | 0.003 |
| 549.8 | 0.004 |